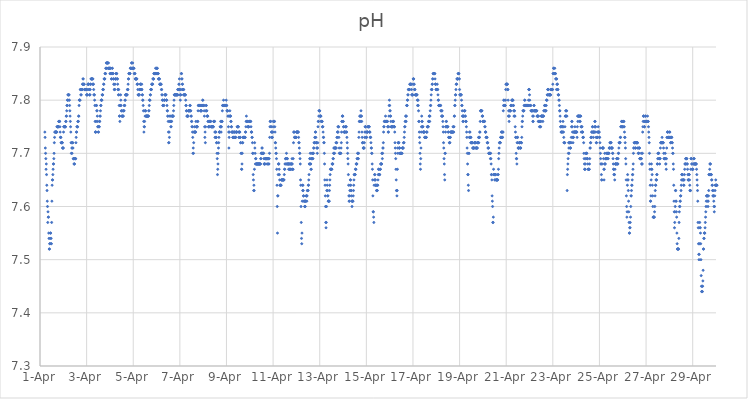
| Category | pH |
|---|---|
| 44287.208333333336 | 7.74 |
| 44287.21875 | 7.73 |
| 44287.229166666664 | 7.71 |
| 44287.239583333336 | 7.7 |
| 44287.25 | 7.69 |
| 44287.260416666664 | 7.67 |
| 44287.270833333336 | 7.68 |
| 44287.28125 | 7.66 |
| 44287.291666666664 | 7.64 |
| 44287.302083333336 | 7.63 |
| 44287.3125 | 7.61 |
| 44287.322916666664 | 7.6 |
| 44287.333333333336 | 7.57 |
| 44287.34375 | 7.59 |
| 44287.354166666664 | 7.58 |
| 44287.364583333336 | 7.58 |
| 44287.375 | 7.55 |
| 44287.385416666664 | 7.54 |
| 44287.395833333336 | 7.52 |
| 44287.40625 | 7.52 |
| 44287.416666666664 | 7.53 |
| 44287.427083333336 | 7.53 |
| 44287.4375 | 7.54 |
| 44287.447916666664 | 7.55 |
| 44287.458333333336 | 7.55 |
| 44287.46875 | 7.53 |
| 44287.479166666664 | 7.54 |
| 44287.489583333336 | 7.53 |
| 44287.5 | 7.57 |
| 44287.510416666664 | 7.61 |
| 44287.520833333336 | 7.64 |
| 44287.53125 | 7.65 |
| 44287.541666666664 | 7.65 |
| 44287.552083333336 | 7.66 |
| 44287.5625 | 7.67 |
| 44287.572916666664 | 7.68 |
| 44287.583333333336 | 7.68 |
| 44287.59375 | 7.69 |
| 44287.604166666664 | 7.7 |
| 44287.614583333336 | 7.72 |
| 44287.625 | 7.73 |
| 44287.635416666664 | 7.74 |
| 44287.645833333336 | 7.74 |
| 44287.65625 | 7.74 |
| 44287.666666666664 | 7.74 |
| 44287.677083333336 | 7.74 |
| 44287.6875 | 7.74 |
| 44287.697916666664 | 7.74 |
| 44287.708333333336 | 7.74 |
| 44287.71875 | 7.74 |
| 44287.729166666664 | 7.75 |
| 44287.739583333336 | 7.75 |
| 44287.75 | 7.75 |
| 44287.760416666664 | 7.75 |
| 44287.770833333336 | 7.75 |
| 44287.78125 | 7.75 |
| 44287.791666666664 | 7.75 |
| 44287.802083333336 | 7.76 |
| 44287.8125 | 7.76 |
| 44287.822916666664 | 7.76 |
| 44287.833333333336 | 7.76 |
| 44287.84375 | 7.76 |
| 44287.854166666664 | 7.75 |
| 44287.864583333336 | 7.74 |
| 44287.875 | 7.73 |
| 44287.885416666664 | 7.73 |
| 44287.895833333336 | 7.73 |
| 44287.90625 | 7.72 |
| 44287.916666666664 | 7.72 |
| 44287.927083333336 | 7.72 |
| 44287.9375 | 7.72 |
| 44287.947916666664 | 7.72 |
| 44287.958333333336 | 7.72 |
| 44287.96875 | 7.71 |
| 44287.979166666664 | 7.71 |
| 44287.989583333336 | 7.71 |
| 44288.0 | 7.71 |
| 44288.010416666664 | 7.74 |
| 44288.020833333336 | 7.75 |
| 44288.03125 | 7.75 |
| 44288.041666666664 | 7.75 |
| 44288.052083333336 | 7.75 |
| 44288.0625 | 7.75 |
| 44288.072916666664 | 7.75 |
| 44288.083333333336 | 7.75 |
| 44288.09375 | 7.75 |
| 44288.104166666664 | 7.76 |
| 44288.114583333336 | 7.76 |
| 44288.125 | 7.77 |
| 44288.135416666664 | 7.77 |
| 44288.145833333336 | 7.78 |
| 44288.15625 | 7.79 |
| 44288.166666666664 | 7.79 |
| 44288.177083333336 | 7.8 |
| 44288.1875 | 7.8 |
| 44288.197916666664 | 7.81 |
| 44288.208333333336 | 7.81 |
| 44288.21875 | 7.81 |
| 44288.229166666664 | 7.81 |
| 44288.239583333336 | 7.8 |
| 44288.25 | 7.81 |
| 44288.260416666664 | 7.8 |
| 44288.270833333336 | 7.79 |
| 44288.28125 | 7.78 |
| 44288.291666666664 | 7.77 |
| 44288.302083333336 | 7.76 |
| 44288.3125 | 7.75 |
| 44288.322916666664 | 7.74 |
| 44288.333333333336 | 7.72 |
| 44288.34375 | 7.7 |
| 44288.354166666664 | 7.72 |
| 44288.364583333336 | 7.71 |
| 44288.375 | 7.7 |
| 44288.385416666664 | 7.71 |
| 44288.395833333336 | 7.72 |
| 44288.40625 | 7.72 |
| 44288.416666666664 | 7.71 |
| 44288.427083333336 | 7.69 |
| 44288.4375 | 7.69 |
| 44288.447916666664 | 7.69 |
| 44288.458333333336 | 7.68 |
| 44288.46875 | 7.68 |
| 44288.479166666664 | 7.68 |
| 44288.489583333336 | 7.69 |
| 44288.5 | 7.69 |
| 44288.510416666664 | 7.69 |
| 44288.520833333336 | 7.69 |
| 44288.53125 | 7.69 |
| 44288.541666666664 | 7.72 |
| 44288.552083333336 | 7.73 |
| 44288.5625 | 7.74 |
| 44288.572916666664 | 7.74 |
| 44288.583333333336 | 7.75 |
| 44288.59375 | 7.75 |
| 44288.604166666664 | 7.75 |
| 44288.614583333336 | 7.75 |
| 44288.625 | 7.76 |
| 44288.635416666664 | 7.76 |
| 44288.645833333336 | 7.76 |
| 44288.65625 | 7.77 |
| 44288.666666666664 | 7.77 |
| 44288.677083333336 | 7.79 |
| 44288.6875 | 7.8 |
| 44288.697916666664 | 7.8 |
| 44288.708333333336 | 7.8 |
| 44288.71875 | 7.8 |
| 44288.729166666664 | 7.82 |
| 44288.739583333336 | 7.82 |
| 44288.75 | 7.81 |
| 44288.760416666664 | 7.82 |
| 44288.770833333336 | 7.81 |
| 44288.78125 | 7.82 |
| 44288.791666666664 | 7.82 |
| 44288.802083333336 | 7.82 |
| 44288.8125 | 7.82 |
| 44288.822916666664 | 7.83 |
| 44288.833333333336 | 7.83 |
| 44288.84375 | 7.84 |
| 44288.854166666664 | 7.84 |
| 44288.864583333336 | 7.83 |
| 44288.875 | 7.83 |
| 44288.885416666664 | 7.83 |
| 44288.895833333336 | 7.83 |
| 44288.90625 | 7.82 |
| 44288.916666666664 | 7.82 |
| 44288.927083333336 | 7.82 |
| 44288.9375 | 7.82 |
| 44288.947916666664 | 7.82 |
| 44288.958333333336 | 7.82 |
| 44288.96875 | 7.82 |
| 44288.979166666664 | 7.82 |
| 44288.989583333336 | 7.82 |
| 44289.0 | 7.81 |
| 44289.010416666664 | 7.81 |
| 44289.020833333336 | 7.81 |
| 44289.03125 | 7.81 |
| 44289.041666666664 | 7.82 |
| 44289.052083333336 | 7.83 |
| 44289.0625 | 7.83 |
| 44289.072916666664 | 7.83 |
| 44289.083333333336 | 7.83 |
| 44289.09375 | 7.83 |
| 44289.104166666664 | 7.82 |
| 44289.114583333336 | 7.82 |
| 44289.125 | 7.81 |
| 44289.135416666664 | 7.81 |
| 44289.145833333336 | 7.81 |
| 44289.15625 | 7.82 |
| 44289.166666666664 | 7.83 |
| 44289.177083333336 | 7.83 |
| 44289.1875 | 7.84 |
| 44289.197916666664 | 7.84 |
| 44289.208333333336 | 7.84 |
| 44289.21875 | 7.84 |
| 44289.229166666664 | 7.84 |
| 44289.239583333336 | 7.84 |
| 44289.25 | 7.84 |
| 44289.260416666664 | 7.83 |
| 44289.270833333336 | 7.84 |
| 44289.28125 | 7.83 |
| 44289.291666666664 | 7.83 |
| 44289.302083333336 | 7.82 |
| 44289.3125 | 7.81 |
| 44289.322916666664 | 7.81 |
| 44289.333333333336 | 7.81 |
| 44289.34375 | 7.8 |
| 44289.354166666664 | 7.79 |
| 44289.364583333336 | 7.76 |
| 44289.375 | 7.74 |
| 44289.385416666664 | 7.74 |
| 44289.395833333336 | 7.74 |
| 44289.40625 | 7.76 |
| 44289.416666666664 | 7.79 |
| 44289.427083333336 | 7.79 |
| 44289.4375 | 7.78 |
| 44289.447916666664 | 7.78 |
| 44289.458333333336 | 7.77 |
| 44289.46875 | 7.76 |
| 44289.479166666664 | 7.75 |
| 44289.489583333336 | 7.75 |
| 44289.5 | 7.74 |
| 44289.510416666664 | 7.74 |
| 44289.520833333336 | 7.75 |
| 44289.53125 | 7.75 |
| 44289.541666666664 | 7.75 |
| 44289.552083333336 | 7.76 |
| 44289.5625 | 7.76 |
| 44289.572916666664 | 7.77 |
| 44289.583333333336 | 7.77 |
| 44289.59375 | 7.78 |
| 44289.604166666664 | 7.79 |
| 44289.614583333336 | 7.79 |
| 44289.625 | 7.8 |
| 44289.635416666664 | 7.8 |
| 44289.645833333336 | 7.8 |
| 44289.65625 | 7.8 |
| 44289.666666666664 | 7.81 |
| 44289.677083333336 | 7.81 |
| 44289.6875 | 7.81 |
| 44289.697916666664 | 7.82 |
| 44289.708333333336 | 7.82 |
| 44289.71875 | 7.82 |
| 44289.729166666664 | 7.83 |
| 44289.739583333336 | 7.83 |
| 44289.75 | 7.84 |
| 44289.760416666664 | 7.84 |
| 44289.770833333336 | 7.84 |
| 44289.78125 | 7.84 |
| 44289.791666666664 | 7.85 |
| 44289.802083333336 | 7.85 |
| 44289.8125 | 7.85 |
| 44289.822916666664 | 7.86 |
| 44289.833333333336 | 7.86 |
| 44289.84375 | 7.87 |
| 44289.854166666664 | 7.86 |
| 44289.864583333336 | 7.87 |
| 44289.875 | 7.87 |
| 44289.885416666664 | 7.87 |
| 44289.895833333336 | 7.87 |
| 44289.90625 | 7.87 |
| 44289.916666666664 | 7.86 |
| 44289.927083333336 | 7.86 |
| 44289.9375 | 7.87 |
| 44289.947916666664 | 7.86 |
| 44289.958333333336 | 7.86 |
| 44289.96875 | 7.86 |
| 44289.979166666664 | 7.86 |
| 44289.989583333336 | 7.86 |
| 44290.0 | 7.85 |
| 44290.010416666664 | 7.86 |
| 44290.020833333336 | 7.86 |
| 44290.03125 | 7.85 |
| 44290.041666666664 | 7.85 |
| 44290.052083333336 | 7.85 |
| 44290.0625 | 7.84 |
| 44290.072916666664 | 7.84 |
| 44290.083333333336 | 7.85 |
| 44290.09375 | 7.86 |
| 44290.104166666664 | 7.86 |
| 44290.114583333336 | 7.85 |
| 44290.125 | 7.85 |
| 44290.135416666664 | 7.85 |
| 44290.145833333336 | 7.84 |
| 44290.15625 | 7.84 |
| 44290.166666666664 | 7.83 |
| 44290.177083333336 | 7.83 |
| 44290.1875 | 7.82 |
| 44290.197916666664 | 7.82 |
| 44290.208333333336 | 7.82 |
| 44290.21875 | 7.83 |
| 44290.229166666664 | 7.84 |
| 44290.239583333336 | 7.84 |
| 44290.25 | 7.84 |
| 44290.260416666664 | 7.85 |
| 44290.270833333336 | 7.85 |
| 44290.28125 | 7.85 |
| 44290.291666666664 | 7.85 |
| 44290.302083333336 | 7.84 |
| 44290.3125 | 7.84 |
| 44290.322916666664 | 7.84 |
| 44290.333333333336 | 7.83 |
| 44290.34375 | 7.82 |
| 44290.354166666664 | 7.82 |
| 44290.364583333336 | 7.81 |
| 44290.375 | 7.82 |
| 44290.385416666664 | 7.81 |
| 44290.395833333336 | 7.79 |
| 44290.40625 | 7.77 |
| 44290.416666666664 | 7.77 |
| 44290.427083333336 | 7.76 |
| 44290.4375 | 7.79 |
| 44290.447916666664 | 7.79 |
| 44290.458333333336 | 7.81 |
| 44290.46875 | 7.8 |
| 44290.479166666664 | 7.79 |
| 44290.489583333336 | 7.78 |
| 44290.5 | 7.78 |
| 44290.510416666664 | 7.77 |
| 44290.520833333336 | 7.77 |
| 44290.53125 | 7.77 |
| 44290.541666666664 | 7.77 |
| 44290.552083333336 | 7.78 |
| 44290.5625 | 7.77 |
| 44290.572916666664 | 7.77 |
| 44290.583333333336 | 7.78 |
| 44290.59375 | 7.78 |
| 44290.604166666664 | 7.78 |
| 44290.614583333336 | 7.79 |
| 44290.625 | 7.79 |
| 44290.635416666664 | 7.79 |
| 44290.645833333336 | 7.8 |
| 44290.65625 | 7.8 |
| 44290.666666666664 | 7.81 |
| 44290.677083333336 | 7.81 |
| 44290.6875 | 7.81 |
| 44290.697916666664 | 7.81 |
| 44290.708333333336 | 7.81 |
| 44290.71875 | 7.81 |
| 44290.729166666664 | 7.81 |
| 44290.739583333336 | 7.81 |
| 44290.75 | 7.82 |
| 44290.760416666664 | 7.82 |
| 44290.770833333336 | 7.82 |
| 44290.78125 | 7.83 |
| 44290.791666666664 | 7.84 |
| 44290.802083333336 | 7.84 |
| 44290.8125 | 7.85 |
| 44290.822916666664 | 7.85 |
| 44290.833333333336 | 7.85 |
| 44290.84375 | 7.85 |
| 44290.854166666664 | 7.85 |
| 44290.864583333336 | 7.85 |
| 44290.875 | 7.86 |
| 44290.885416666664 | 7.86 |
| 44290.895833333336 | 7.86 |
| 44290.90625 | 7.86 |
| 44290.916666666664 | 7.86 |
| 44290.927083333336 | 7.87 |
| 44290.9375 | 7.87 |
| 44290.947916666664 | 7.86 |
| 44290.958333333336 | 7.86 |
| 44290.96875 | 7.86 |
| 44290.979166666664 | 7.87 |
| 44290.989583333336 | 7.86 |
| 44291.0 | 7.86 |
| 44291.010416666664 | 7.86 |
| 44291.020833333336 | 7.86 |
| 44291.03125 | 7.86 |
| 44291.041666666664 | 7.85 |
| 44291.052083333336 | 7.85 |
| 44291.0625 | 7.85 |
| 44291.072916666664 | 7.85 |
| 44291.083333333336 | 7.84 |
| 44291.09375 | 7.84 |
| 44291.104166666664 | 7.84 |
| 44291.114583333336 | 7.84 |
| 44291.125 | 7.84 |
| 44291.135416666664 | 7.84 |
| 44291.145833333336 | 7.84 |
| 44291.15625 | 7.84 |
| 44291.166666666664 | 7.83 |
| 44291.177083333336 | 7.83 |
| 44291.1875 | 7.83 |
| 44291.197916666664 | 7.82 |
| 44291.208333333336 | 7.81 |
| 44291.21875 | 7.81 |
| 44291.229166666664 | 7.81 |
| 44291.239583333336 | 7.81 |
| 44291.25 | 7.81 |
| 44291.260416666664 | 7.81 |
| 44291.270833333336 | 7.82 |
| 44291.28125 | 7.82 |
| 44291.291666666664 | 7.82 |
| 44291.302083333336 | 7.83 |
| 44291.3125 | 7.83 |
| 44291.322916666664 | 7.83 |
| 44291.333333333336 | 7.82 |
| 44291.34375 | 7.82 |
| 44291.354166666664 | 7.82 |
| 44291.364583333336 | 7.83 |
| 44291.375 | 7.82 |
| 44291.385416666664 | 7.81 |
| 44291.395833333336 | 7.81 |
| 44291.40625 | 7.8 |
| 44291.416666666664 | 7.8 |
| 44291.427083333336 | 7.79 |
| 44291.4375 | 7.78 |
| 44291.447916666664 | 7.76 |
| 44291.458333333336 | 7.74 |
| 44291.46875 | 7.75 |
| 44291.479166666664 | 7.75 |
| 44291.489583333336 | 7.76 |
| 44291.5 | 7.78 |
| 44291.510416666664 | 7.77 |
| 44291.520833333336 | 7.78 |
| 44291.53125 | 7.78 |
| 44291.541666666664 | 7.77 |
| 44291.552083333336 | 7.77 |
| 44291.5625 | 7.77 |
| 44291.572916666664 | 7.77 |
| 44291.583333333336 | 7.77 |
| 44291.59375 | 7.77 |
| 44291.604166666664 | 7.77 |
| 44291.614583333336 | 7.77 |
| 44291.625 | 7.77 |
| 44291.635416666664 | 7.77 |
| 44291.645833333336 | 7.77 |
| 44291.65625 | 7.77 |
| 44291.666666666664 | 7.78 |
| 44291.677083333336 | 7.78 |
| 44291.6875 | 7.79 |
| 44291.697916666664 | 7.8 |
| 44291.708333333336 | 7.8 |
| 44291.71875 | 7.8 |
| 44291.729166666664 | 7.81 |
| 44291.739583333336 | 7.81 |
| 44291.75 | 7.82 |
| 44291.760416666664 | 7.82 |
| 44291.770833333336 | 7.82 |
| 44291.78125 | 7.82 |
| 44291.791666666664 | 7.83 |
| 44291.802083333336 | 7.83 |
| 44291.8125 | 7.83 |
| 44291.822916666664 | 7.83 |
| 44291.833333333336 | 7.83 |
| 44291.84375 | 7.84 |
| 44291.854166666664 | 7.84 |
| 44291.864583333336 | 7.84 |
| 44291.875 | 7.84 |
| 44291.885416666664 | 7.85 |
| 44291.895833333336 | 7.85 |
| 44291.90625 | 7.85 |
| 44291.916666666664 | 7.85 |
| 44291.927083333336 | 7.85 |
| 44291.9375 | 7.85 |
| 44291.947916666664 | 7.85 |
| 44291.958333333336 | 7.86 |
| 44291.96875 | 7.85 |
| 44291.979166666664 | 7.85 |
| 44291.989583333336 | 7.85 |
| 44292.0 | 7.86 |
| 44292.010416666664 | 7.86 |
| 44292.020833333336 | 7.86 |
| 44292.03125 | 7.86 |
| 44292.041666666664 | 7.85 |
| 44292.052083333336 | 7.85 |
| 44292.0625 | 7.85 |
| 44292.072916666664 | 7.85 |
| 44292.083333333336 | 7.84 |
| 44292.09375 | 7.84 |
| 44292.104166666664 | 7.84 |
| 44292.114583333336 | 7.84 |
| 44292.125 | 7.84 |
| 44292.135416666664 | 7.83 |
| 44292.145833333336 | 7.83 |
| 44292.15625 | 7.83 |
| 44292.166666666664 | 7.83 |
| 44292.177083333336 | 7.83 |
| 44292.1875 | 7.83 |
| 44292.197916666664 | 7.83 |
| 44292.208333333336 | 7.82 |
| 44292.21875 | 7.82 |
| 44292.229166666664 | 7.81 |
| 44292.239583333336 | 7.81 |
| 44292.25 | 7.8 |
| 44292.260416666664 | 7.8 |
| 44292.270833333336 | 7.79 |
| 44292.28125 | 7.79 |
| 44292.291666666664 | 7.79 |
| 44292.302083333336 | 7.79 |
| 44292.3125 | 7.79 |
| 44292.322916666664 | 7.8 |
| 44292.333333333336 | 7.8 |
| 44292.34375 | 7.8 |
| 44292.354166666664 | 7.81 |
| 44292.364583333336 | 7.81 |
| 44292.375 | 7.81 |
| 44292.385416666664 | 7.81 |
| 44292.395833333336 | 7.81 |
| 44292.40625 | 7.81 |
| 44292.416666666664 | 7.8 |
| 44292.427083333336 | 7.8 |
| 44292.4375 | 7.8 |
| 44292.447916666664 | 7.79 |
| 44292.458333333336 | 7.78 |
| 44292.46875 | 7.78 |
| 44292.479166666664 | 7.77 |
| 44292.489583333336 | 7.77 |
| 44292.5 | 7.76 |
| 44292.510416666664 | 7.74 |
| 44292.520833333336 | 7.72 |
| 44292.53125 | 7.72 |
| 44292.541666666664 | 7.74 |
| 44292.552083333336 | 7.73 |
| 44292.5625 | 7.76 |
| 44292.572916666664 | 7.77 |
| 44292.583333333336 | 7.77 |
| 44292.59375 | 7.76 |
| 44292.604166666664 | 7.76 |
| 44292.614583333336 | 7.75 |
| 44292.625 | 7.75 |
| 44292.635416666664 | 7.76 |
| 44292.645833333336 | 7.76 |
| 44292.65625 | 7.77 |
| 44292.666666666664 | 7.77 |
| 44292.677083333336 | 7.77 |
| 44292.6875 | 7.77 |
| 44292.697916666664 | 7.77 |
| 44292.708333333336 | 7.77 |
| 44292.71875 | 7.77 |
| 44292.729166666664 | 7.78 |
| 44292.739583333336 | 7.79 |
| 44292.75 | 7.8 |
| 44292.760416666664 | 7.81 |
| 44292.770833333336 | 7.81 |
| 44292.78125 | 7.81 |
| 44292.791666666664 | 7.81 |
| 44292.802083333336 | 7.81 |
| 44292.8125 | 7.81 |
| 44292.822916666664 | 7.81 |
| 44292.833333333336 | 7.81 |
| 44292.84375 | 7.81 |
| 44292.854166666664 | 7.81 |
| 44292.864583333336 | 7.81 |
| 44292.875 | 7.81 |
| 44292.885416666664 | 7.81 |
| 44292.895833333336 | 7.81 |
| 44292.90625 | 7.82 |
| 44292.916666666664 | 7.81 |
| 44292.927083333336 | 7.82 |
| 44292.9375 | 7.82 |
| 44292.947916666664 | 7.82 |
| 44292.958333333336 | 7.83 |
| 44292.96875 | 7.83 |
| 44292.979166666664 | 7.84 |
| 44292.989583333336 | 7.82 |
| 44293.0 | 7.82 |
| 44293.010416666664 | 7.81 |
| 44293.020833333336 | 7.8 |
| 44293.03125 | 7.81 |
| 44293.041666666664 | 7.81 |
| 44293.052083333336 | 7.82 |
| 44293.0625 | 7.85 |
| 44293.072916666664 | 7.85 |
| 44293.083333333336 | 7.84 |
| 44293.09375 | 7.84 |
| 44293.104166666664 | 7.83 |
| 44293.114583333336 | 7.83 |
| 44293.125 | 7.82 |
| 44293.135416666664 | 7.82 |
| 44293.145833333336 | 7.82 |
| 44293.15625 | 7.81 |
| 44293.166666666664 | 7.82 |
| 44293.177083333336 | 7.81 |
| 44293.1875 | 7.81 |
| 44293.197916666664 | 7.81 |
| 44293.208333333336 | 7.81 |
| 44293.21875 | 7.81 |
| 44293.229166666664 | 7.81 |
| 44293.239583333336 | 7.81 |
| 44293.25 | 7.8 |
| 44293.260416666664 | 7.79 |
| 44293.270833333336 | 7.79 |
| 44293.28125 | 7.78 |
| 44293.291666666664 | 7.78 |
| 44293.302083333336 | 7.77 |
| 44293.3125 | 7.77 |
| 44293.322916666664 | 7.77 |
| 44293.333333333336 | 7.77 |
| 44293.34375 | 7.77 |
| 44293.354166666664 | 7.77 |
| 44293.364583333336 | 7.78 |
| 44293.375 | 7.78 |
| 44293.385416666664 | 7.78 |
| 44293.395833333336 | 7.78 |
| 44293.40625 | 7.78 |
| 44293.416666666664 | 7.78 |
| 44293.427083333336 | 7.79 |
| 44293.4375 | 7.78 |
| 44293.447916666664 | 7.79 |
| 44293.458333333336 | 7.78 |
| 44293.46875 | 7.78 |
| 44293.479166666664 | 7.77 |
| 44293.489583333336 | 7.77 |
| 44293.5 | 7.76 |
| 44293.510416666664 | 7.76 |
| 44293.520833333336 | 7.75 |
| 44293.53125 | 7.75 |
| 44293.541666666664 | 7.74 |
| 44293.552083333336 | 7.73 |
| 44293.5625 | 7.7 |
| 44293.572916666664 | 7.71 |
| 44293.583333333336 | 7.7 |
| 44293.59375 | 7.72 |
| 44293.604166666664 | 7.74 |
| 44293.614583333336 | 7.74 |
| 44293.625 | 7.75 |
| 44293.635416666664 | 7.74 |
| 44293.645833333336 | 7.74 |
| 44293.65625 | 7.74 |
| 44293.666666666664 | 7.74 |
| 44293.677083333336 | 7.74 |
| 44293.6875 | 7.76 |
| 44293.697916666664 | 7.75 |
| 44293.708333333336 | 7.75 |
| 44293.71875 | 7.75 |
| 44293.729166666664 | 7.75 |
| 44293.739583333336 | 7.75 |
| 44293.75 | 7.75 |
| 44293.760416666664 | 7.76 |
| 44293.770833333336 | 7.76 |
| 44293.78125 | 7.78 |
| 44293.791666666664 | 7.79 |
| 44293.802083333336 | 7.79 |
| 44293.8125 | 7.79 |
| 44293.822916666664 | 7.79 |
| 44293.833333333336 | 7.79 |
| 44293.84375 | 7.79 |
| 44293.854166666664 | 7.79 |
| 44293.864583333336 | 7.79 |
| 44293.875 | 7.79 |
| 44293.885416666664 | 7.78 |
| 44293.895833333336 | 7.78 |
| 44293.90625 | 7.78 |
| 44293.916666666664 | 7.78 |
| 44293.927083333336 | 7.78 |
| 44293.9375 | 7.79 |
| 44293.947916666664 | 7.79 |
| 44293.958333333336 | 7.79 |
| 44293.96875 | 7.79 |
| 44293.979166666664 | 7.8 |
| 44293.989583333336 | 7.8 |
| 44294.0 | 7.79 |
| 44294.010416666664 | 7.79 |
| 44294.020833333336 | 7.79 |
| 44294.03125 | 7.79 |
| 44294.041666666664 | 7.78 |
| 44294.052083333336 | 7.77 |
| 44294.0625 | 7.75 |
| 44294.072916666664 | 7.73 |
| 44294.083333333336 | 7.74 |
| 44294.09375 | 7.72 |
| 44294.104166666664 | 7.75 |
| 44294.114583333336 | 7.78 |
| 44294.125 | 7.79 |
| 44294.135416666664 | 7.79 |
| 44294.145833333336 | 7.78 |
| 44294.15625 | 7.78 |
| 44294.166666666664 | 7.77 |
| 44294.177083333336 | 7.77 |
| 44294.1875 | 7.77 |
| 44294.197916666664 | 7.77 |
| 44294.208333333336 | 7.76 |
| 44294.21875 | 7.76 |
| 44294.229166666664 | 7.75 |
| 44294.239583333336 | 7.75 |
| 44294.25 | 7.75 |
| 44294.260416666664 | 7.75 |
| 44294.270833333336 | 7.76 |
| 44294.28125 | 7.76 |
| 44294.291666666664 | 7.76 |
| 44294.302083333336 | 7.76 |
| 44294.3125 | 7.76 |
| 44294.322916666664 | 7.76 |
| 44294.333333333336 | 7.75 |
| 44294.34375 | 7.75 |
| 44294.354166666664 | 7.75 |
| 44294.364583333336 | 7.75 |
| 44294.375 | 7.75 |
| 44294.385416666664 | 7.75 |
| 44294.395833333336 | 7.75 |
| 44294.40625 | 7.75 |
| 44294.416666666664 | 7.75 |
| 44294.427083333336 | 7.75 |
| 44294.4375 | 7.75 |
| 44294.447916666664 | 7.76 |
| 44294.458333333336 | 7.76 |
| 44294.46875 | 7.76 |
| 44294.479166666664 | 7.76 |
| 44294.489583333336 | 7.76 |
| 44294.5 | 7.74 |
| 44294.510416666664 | 7.73 |
| 44294.520833333336 | 7.73 |
| 44294.53125 | 7.74 |
| 44294.541666666664 | 7.74 |
| 44294.552083333336 | 7.73 |
| 44294.5625 | 7.73 |
| 44294.572916666664 | 7.72 |
| 44294.583333333336 | 7.72 |
| 44294.59375 | 7.7 |
| 44294.604166666664 | 7.69 |
| 44294.614583333336 | 7.66 |
| 44294.625 | 7.67 |
| 44294.635416666664 | 7.68 |
| 44294.645833333336 | 7.7 |
| 44294.65625 | 7.71 |
| 44294.666666666664 | 7.72 |
| 44294.677083333336 | 7.73 |
| 44294.6875 | 7.74 |
| 44294.697916666664 | 7.74 |
| 44294.708333333336 | 7.74 |
| 44294.71875 | 7.74 |
| 44294.729166666664 | 7.75 |
| 44294.739583333336 | 7.75 |
| 44294.75 | 7.76 |
| 44294.760416666664 | 7.75 |
| 44294.770833333336 | 7.74 |
| 44294.78125 | 7.75 |
| 44294.791666666664 | 7.76 |
| 44294.802083333336 | 7.76 |
| 44294.8125 | 7.76 |
| 44294.822916666664 | 7.78 |
| 44294.833333333336 | 7.79 |
| 44294.84375 | 7.79 |
| 44294.854166666664 | 7.79 |
| 44294.864583333336 | 7.79 |
| 44294.875 | 7.8 |
| 44294.885416666664 | 7.79 |
| 44294.895833333336 | 7.79 |
| 44294.90625 | 7.79 |
| 44294.916666666664 | 7.79 |
| 44294.927083333336 | 7.79 |
| 44294.9375 | 7.79 |
| 44294.947916666664 | 7.79 |
| 44294.958333333336 | 7.79 |
| 44294.96875 | 7.79 |
| 44294.979166666664 | 7.79 |
| 44294.989583333336 | 7.8 |
| 44295.0 | 7.79 |
| 44295.010416666664 | 7.79 |
| 44295.020833333336 | 7.78 |
| 44295.03125 | 7.78 |
| 44295.041666666664 | 7.78 |
| 44295.052083333336 | 7.78 |
| 44295.0625 | 7.77 |
| 44295.072916666664 | 7.77 |
| 44295.083333333336 | 7.75 |
| 44295.09375 | 7.74 |
| 44295.104166666664 | 7.71 |
| 44295.114583333336 | 7.73 |
| 44295.125 | 7.74 |
| 44295.135416666664 | 7.77 |
| 44295.145833333336 | 7.78 |
| 44295.15625 | 7.77 |
| 44295.166666666664 | 7.77 |
| 44295.177083333336 | 7.77 |
| 44295.1875 | 7.76 |
| 44295.197916666664 | 7.76 |
| 44295.208333333336 | 7.75 |
| 44295.21875 | 7.75 |
| 44295.229166666664 | 7.74 |
| 44295.239583333336 | 7.74 |
| 44295.25 | 7.74 |
| 44295.260416666664 | 7.74 |
| 44295.270833333336 | 7.73 |
| 44295.28125 | 7.73 |
| 44295.291666666664 | 7.73 |
| 44295.302083333336 | 7.73 |
| 44295.3125 | 7.74 |
| 44295.322916666664 | 7.74 |
| 44295.333333333336 | 7.74 |
| 44295.34375 | 7.73 |
| 44295.354166666664 | 7.74 |
| 44295.364583333336 | 7.73 |
| 44295.375 | 7.73 |
| 44295.385416666664 | 7.73 |
| 44295.395833333336 | 7.73 |
| 44295.40625 | 7.74 |
| 44295.416666666664 | 7.74 |
| 44295.427083333336 | 7.74 |
| 44295.4375 | 7.74 |
| 44295.447916666664 | 7.74 |
| 44295.458333333336 | 7.75 |
| 44295.46875 | 7.75 |
| 44295.479166666664 | 7.75 |
| 44295.489583333336 | 7.75 |
| 44295.5 | 7.75 |
| 44295.510416666664 | 7.75 |
| 44295.520833333336 | 7.74 |
| 44295.53125 | 7.73 |
| 44295.541666666664 | 7.73 |
| 44295.552083333336 | 7.74 |
| 44295.5625 | 7.74 |
| 44295.572916666664 | 7.74 |
| 44295.583333333336 | 7.73 |
| 44295.59375 | 7.73 |
| 44295.604166666664 | 7.72 |
| 44295.614583333336 | 7.72 |
| 44295.625 | 7.7 |
| 44295.635416666664 | 7.7 |
| 44295.645833333336 | 7.67 |
| 44295.65625 | 7.67 |
| 44295.666666666664 | 7.68 |
| 44295.677083333336 | 7.7 |
| 44295.6875 | 7.72 |
| 44295.697916666664 | 7.72 |
| 44295.708333333336 | 7.73 |
| 44295.71875 | 7.73 |
| 44295.729166666664 | 7.73 |
| 44295.739583333336 | 7.73 |
| 44295.75 | 7.73 |
| 44295.760416666664 | 7.73 |
| 44295.770833333336 | 7.73 |
| 44295.78125 | 7.73 |
| 44295.791666666664 | 7.73 |
| 44295.802083333336 | 7.73 |
| 44295.8125 | 7.74 |
| 44295.822916666664 | 7.74 |
| 44295.833333333336 | 7.75 |
| 44295.84375 | 7.76 |
| 44295.854166666664 | 7.77 |
| 44295.864583333336 | 7.76 |
| 44295.875 | 7.76 |
| 44295.885416666664 | 7.76 |
| 44295.895833333336 | 7.76 |
| 44295.90625 | 7.76 |
| 44295.916666666664 | 7.75 |
| 44295.927083333336 | 7.75 |
| 44295.9375 | 7.75 |
| 44295.947916666664 | 7.75 |
| 44295.958333333336 | 7.75 |
| 44295.96875 | 7.76 |
| 44295.979166666664 | 7.76 |
| 44295.989583333336 | 7.76 |
| 44296.0 | 7.76 |
| 44296.010416666664 | 7.76 |
| 44296.020833333336 | 7.76 |
| 44296.03125 | 7.76 |
| 44296.041666666664 | 7.76 |
| 44296.052083333336 | 7.75 |
| 44296.0625 | 7.74 |
| 44296.072916666664 | 7.74 |
| 44296.083333333336 | 7.74 |
| 44296.09375 | 7.73 |
| 44296.104166666664 | 7.73 |
| 44296.114583333336 | 7.72 |
| 44296.125 | 7.7 |
| 44296.135416666664 | 7.7 |
| 44296.145833333336 | 7.66 |
| 44296.15625 | 7.65 |
| 44296.166666666664 | 7.63 |
| 44296.177083333336 | 7.64 |
| 44296.1875 | 7.63 |
| 44296.197916666664 | 7.67 |
| 44296.208333333336 | 7.72 |
| 44296.21875 | 7.71 |
| 44296.229166666664 | 7.7 |
| 44296.239583333336 | 7.68 |
| 44296.25 | 7.69 |
| 44296.260416666664 | 7.69 |
| 44296.270833333336 | 7.68 |
| 44296.28125 | 7.68 |
| 44296.291666666664 | 7.68 |
| 44296.302083333336 | 7.68 |
| 44296.3125 | 7.68 |
| 44296.322916666664 | 7.68 |
| 44296.333333333336 | 7.68 |
| 44296.34375 | 7.68 |
| 44296.354166666664 | 7.68 |
| 44296.364583333336 | 7.68 |
| 44296.375 | 7.68 |
| 44296.385416666664 | 7.68 |
| 44296.395833333336 | 7.68 |
| 44296.40625 | 7.68 |
| 44296.416666666664 | 7.68 |
| 44296.427083333336 | 7.68 |
| 44296.4375 | 7.68 |
| 44296.447916666664 | 7.68 |
| 44296.458333333336 | 7.68 |
| 44296.46875 | 7.69 |
| 44296.479166666664 | 7.69 |
| 44296.489583333336 | 7.7 |
| 44296.5 | 7.7 |
| 44296.510416666664 | 7.7 |
| 44296.520833333336 | 7.71 |
| 44296.53125 | 7.71 |
| 44296.541666666664 | 7.7 |
| 44296.552083333336 | 7.7 |
| 44296.5625 | 7.7 |
| 44296.572916666664 | 7.7 |
| 44296.583333333336 | 7.7 |
| 44296.59375 | 7.7 |
| 44296.604166666664 | 7.69 |
| 44296.614583333336 | 7.68 |
| 44296.625 | 7.68 |
| 44296.635416666664 | 7.68 |
| 44296.645833333336 | 7.69 |
| 44296.65625 | 7.68 |
| 44296.666666666664 | 7.69 |
| 44296.677083333336 | 7.69 |
| 44296.6875 | 7.69 |
| 44296.697916666664 | 7.69 |
| 44296.708333333336 | 7.69 |
| 44296.71875 | 7.69 |
| 44296.729166666664 | 7.69 |
| 44296.739583333336 | 7.68 |
| 44296.75 | 7.69 |
| 44296.760416666664 | 7.69 |
| 44296.770833333336 | 7.68 |
| 44296.78125 | 7.69 |
| 44296.791666666664 | 7.69 |
| 44296.802083333336 | 7.69 |
| 44296.8125 | 7.68 |
| 44296.822916666664 | 7.68 |
| 44296.833333333336 | 7.69 |
| 44296.84375 | 7.7 |
| 44296.854166666664 | 7.73 |
| 44296.864583333336 | 7.75 |
| 44296.875 | 7.76 |
| 44296.885416666664 | 7.76 |
| 44296.895833333336 | 7.76 |
| 44296.90625 | 7.75 |
| 44296.916666666664 | 7.75 |
| 44296.927083333336 | 7.74 |
| 44296.9375 | 7.74 |
| 44296.947916666664 | 7.73 |
| 44296.958333333336 | 7.73 |
| 44296.96875 | 7.73 |
| 44296.979166666664 | 7.74 |
| 44296.989583333336 | 7.74 |
| 44297.0 | 7.75 |
| 44297.010416666664 | 7.76 |
| 44297.020833333336 | 7.76 |
| 44297.03125 | 7.76 |
| 44297.041666666664 | 7.76 |
| 44297.052083333336 | 7.76 |
| 44297.0625 | 7.76 |
| 44297.072916666664 | 7.75 |
| 44297.083333333336 | 7.74 |
| 44297.09375 | 7.72 |
| 44297.104166666664 | 7.72 |
| 44297.114583333336 | 7.71 |
| 44297.125 | 7.7 |
| 44297.135416666664 | 7.7 |
| 44297.145833333336 | 7.69 |
| 44297.15625 | 7.67 |
| 44297.166666666664 | 7.64 |
| 44297.177083333336 | 7.6 |
| 44297.1875 | 7.55 |
| 44297.197916666664 | 7.62 |
| 44297.208333333336 | 7.62 |
| 44297.21875 | 7.66 |
| 44297.229166666664 | 7.68 |
| 44297.239583333336 | 7.68 |
| 44297.25 | 7.68 |
| 44297.260416666664 | 7.67 |
| 44297.270833333336 | 7.66 |
| 44297.28125 | 7.65 |
| 44297.291666666664 | 7.64 |
| 44297.302083333336 | 7.64 |
| 44297.3125 | 7.64 |
| 44297.322916666664 | 7.64 |
| 44297.333333333336 | 7.64 |
| 44297.34375 | 7.64 |
| 44297.354166666664 | 7.65 |
| 44297.364583333336 | 7.65 |
| 44297.375 | 7.65 |
| 44297.385416666664 | 7.65 |
| 44297.395833333336 | 7.65 |
| 44297.40625 | 7.65 |
| 44297.416666666664 | 7.65 |
| 44297.427083333336 | 7.65 |
| 44297.4375 | 7.65 |
| 44297.447916666664 | 7.65 |
| 44297.458333333336 | 7.65 |
| 44297.46875 | 7.65 |
| 44297.479166666664 | 7.66 |
| 44297.489583333336 | 7.67 |
| 44297.5 | 7.67 |
| 44297.510416666664 | 7.68 |
| 44297.520833333336 | 7.68 |
| 44297.53125 | 7.69 |
| 44297.541666666664 | 7.69 |
| 44297.552083333336 | 7.69 |
| 44297.5625 | 7.69 |
| 44297.572916666664 | 7.7 |
| 44297.583333333336 | 7.68 |
| 44297.59375 | 7.68 |
| 44297.604166666664 | 7.69 |
| 44297.614583333336 | 7.69 |
| 44297.625 | 7.68 |
| 44297.635416666664 | 7.68 |
| 44297.645833333336 | 7.68 |
| 44297.65625 | 7.68 |
| 44297.666666666664 | 7.67 |
| 44297.677083333336 | 7.68 |
| 44297.6875 | 7.68 |
| 44297.697916666664 | 7.67 |
| 44297.708333333336 | 7.67 |
| 44297.71875 | 7.68 |
| 44297.729166666664 | 7.68 |
| 44297.739583333336 | 7.68 |
| 44297.75 | 7.67 |
| 44297.760416666664 | 7.67 |
| 44297.770833333336 | 7.67 |
| 44297.78125 | 7.68 |
| 44297.791666666664 | 7.68 |
| 44297.802083333336 | 7.68 |
| 44297.8125 | 7.69 |
| 44297.822916666664 | 7.68 |
| 44297.833333333336 | 7.67 |
| 44297.84375 | 7.67 |
| 44297.854166666664 | 7.67 |
| 44297.864583333336 | 7.69 |
| 44297.875 | 7.72 |
| 44297.885416666664 | 7.74 |
| 44297.895833333336 | 7.74 |
| 44297.90625 | 7.74 |
| 44297.916666666664 | 7.73 |
| 44297.927083333336 | 7.73 |
| 44297.9375 | 7.73 |
| 44297.947916666664 | 7.73 |
| 44297.958333333336 | 7.73 |
| 44297.96875 | 7.73 |
| 44297.979166666664 | 7.73 |
| 44297.989583333336 | 7.73 |
| 44298.0 | 7.74 |
| 44298.010416666664 | 7.74 |
| 44298.020833333336 | 7.74 |
| 44298.03125 | 7.74 |
| 44298.041666666664 | 7.74 |
| 44298.052083333336 | 7.74 |
| 44298.0625 | 7.74 |
| 44298.072916666664 | 7.74 |
| 44298.083333333336 | 7.74 |
| 44298.09375 | 7.73 |
| 44298.104166666664 | 7.72 |
| 44298.114583333336 | 7.72 |
| 44298.125 | 7.71 |
| 44298.135416666664 | 7.7 |
| 44298.145833333336 | 7.7 |
| 44298.15625 | 7.69 |
| 44298.166666666664 | 7.68 |
| 44298.177083333336 | 7.65 |
| 44298.1875 | 7.64 |
| 44298.197916666664 | 7.6 |
| 44298.208333333336 | 7.57 |
| 44298.21875 | 7.54 |
| 44298.229166666664 | 7.53 |
| 44298.239583333336 | 7.55 |
| 44298.25 | 7.61 |
| 44298.260416666664 | 7.64 |
| 44298.270833333336 | 7.63 |
| 44298.28125 | 7.64 |
| 44298.291666666664 | 7.63 |
| 44298.302083333336 | 7.62 |
| 44298.3125 | 7.62 |
| 44298.322916666664 | 7.61 |
| 44298.333333333336 | 7.61 |
| 44298.34375 | 7.61 |
| 44298.354166666664 | 7.6 |
| 44298.364583333336 | 7.6 |
| 44298.375 | 7.6 |
| 44298.385416666664 | 7.61 |
| 44298.395833333336 | 7.61 |
| 44298.40625 | 7.61 |
| 44298.416666666664 | 7.62 |
| 44298.427083333336 | 7.62 |
| 44298.4375 | 7.62 |
| 44298.447916666664 | 7.61 |
| 44298.458333333336 | 7.62 |
| 44298.46875 | 7.63 |
| 44298.479166666664 | 7.63 |
| 44298.489583333336 | 7.63 |
| 44298.5 | 7.63 |
| 44298.510416666664 | 7.64 |
| 44298.520833333336 | 7.64 |
| 44298.53125 | 7.65 |
| 44298.541666666664 | 7.66 |
| 44298.552083333336 | 7.68 |
| 44298.5625 | 7.68 |
| 44298.572916666664 | 7.69 |
| 44298.583333333336 | 7.69 |
| 44298.59375 | 7.7 |
| 44298.604166666664 | 7.68 |
| 44298.614583333336 | 7.68 |
| 44298.625 | 7.67 |
| 44298.635416666664 | 7.67 |
| 44298.645833333336 | 7.69 |
| 44298.65625 | 7.69 |
| 44298.666666666664 | 7.7 |
| 44298.677083333336 | 7.69 |
| 44298.6875 | 7.7 |
| 44298.697916666664 | 7.69 |
| 44298.708333333336 | 7.69 |
| 44298.71875 | 7.7 |
| 44298.729166666664 | 7.7 |
| 44298.739583333336 | 7.71 |
| 44298.75 | 7.71 |
| 44298.760416666664 | 7.72 |
| 44298.770833333336 | 7.72 |
| 44298.78125 | 7.72 |
| 44298.791666666664 | 7.73 |
| 44298.802083333336 | 7.73 |
| 44298.8125 | 7.74 |
| 44298.822916666664 | 7.74 |
| 44298.833333333336 | 7.73 |
| 44298.84375 | 7.72 |
| 44298.854166666664 | 7.72 |
| 44298.864583333336 | 7.72 |
| 44298.875 | 7.71 |
| 44298.885416666664 | 7.71 |
| 44298.895833333336 | 7.7 |
| 44298.90625 | 7.71 |
| 44298.916666666664 | 7.72 |
| 44298.927083333336 | 7.75 |
| 44298.9375 | 7.76 |
| 44298.947916666664 | 7.76 |
| 44298.958333333336 | 7.77 |
| 44298.96875 | 7.78 |
| 44298.979166666664 | 7.78 |
| 44298.989583333336 | 7.78 |
| 44299.0 | 7.78 |
| 44299.010416666664 | 7.77 |
| 44299.020833333336 | 7.77 |
| 44299.03125 | 7.77 |
| 44299.041666666664 | 7.77 |
| 44299.052083333336 | 7.77 |
| 44299.0625 | 7.76 |
| 44299.072916666664 | 7.76 |
| 44299.083333333336 | 7.76 |
| 44299.09375 | 7.76 |
| 44299.104166666664 | 7.76 |
| 44299.114583333336 | 7.75 |
| 44299.125 | 7.75 |
| 44299.135416666664 | 7.75 |
| 44299.145833333336 | 7.74 |
| 44299.15625 | 7.73 |
| 44299.166666666664 | 7.73 |
| 44299.177083333336 | 7.72 |
| 44299.1875 | 7.72 |
| 44299.197916666664 | 7.7 |
| 44299.208333333336 | 7.68 |
| 44299.21875 | 7.65 |
| 44299.229166666664 | 7.64 |
| 44299.239583333336 | 7.62 |
| 44299.25 | 7.6 |
| 44299.260416666664 | 7.57 |
| 44299.270833333336 | 7.56 |
| 44299.28125 | 7.57 |
| 44299.291666666664 | 7.6 |
| 44299.302083333336 | 7.63 |
| 44299.3125 | 7.65 |
| 44299.322916666664 | 7.64 |
| 44299.333333333336 | 7.63 |
| 44299.34375 | 7.62 |
| 44299.354166666664 | 7.62 |
| 44299.364583333336 | 7.61 |
| 44299.375 | 7.61 |
| 44299.385416666664 | 7.61 |
| 44299.395833333336 | 7.61 |
| 44299.40625 | 7.61 |
| 44299.416666666664 | 7.63 |
| 44299.427083333336 | 7.64 |
| 44299.4375 | 7.65 |
| 44299.447916666664 | 7.66 |
| 44299.458333333336 | 7.67 |
| 44299.46875 | 7.67 |
| 44299.479166666664 | 7.67 |
| 44299.489583333336 | 7.67 |
| 44299.5 | 7.67 |
| 44299.510416666664 | 7.67 |
| 44299.520833333336 | 7.67 |
| 44299.53125 | 7.68 |
| 44299.541666666664 | 7.68 |
| 44299.552083333336 | 7.68 |
| 44299.5625 | 7.68 |
| 44299.572916666664 | 7.69 |
| 44299.583333333336 | 7.69 |
| 44299.59375 | 7.7 |
| 44299.604166666664 | 7.71 |
| 44299.614583333336 | 7.7 |
| 44299.625 | 7.71 |
| 44299.635416666664 | 7.7 |
| 44299.645833333336 | 7.71 |
| 44299.65625 | 7.71 |
| 44299.666666666664 | 7.71 |
| 44299.677083333336 | 7.71 |
| 44299.6875 | 7.71 |
| 44299.697916666664 | 7.72 |
| 44299.708333333336 | 7.71 |
| 44299.71875 | 7.72 |
| 44299.729166666664 | 7.72 |
| 44299.739583333336 | 7.73 |
| 44299.75 | 7.73 |
| 44299.760416666664 | 7.74 |
| 44299.770833333336 | 7.74 |
| 44299.78125 | 7.75 |
| 44299.791666666664 | 7.74 |
| 44299.802083333336 | 7.75 |
| 44299.8125 | 7.75 |
| 44299.822916666664 | 7.73 |
| 44299.833333333336 | 7.71 |
| 44299.84375 | 7.7 |
| 44299.854166666664 | 7.7 |
| 44299.864583333336 | 7.7 |
| 44299.875 | 7.7 |
| 44299.885416666664 | 7.7 |
| 44299.895833333336 | 7.7 |
| 44299.90625 | 7.7 |
| 44299.916666666664 | 7.71 |
| 44299.927083333336 | 7.72 |
| 44299.9375 | 7.74 |
| 44299.947916666664 | 7.76 |
| 44299.958333333336 | 7.76 |
| 44299.96875 | 7.77 |
| 44299.979166666664 | 7.77 |
| 44299.989583333336 | 7.77 |
| 44300.0 | 7.76 |
| 44300.010416666664 | 7.76 |
| 44300.020833333336 | 7.75 |
| 44300.03125 | 7.75 |
| 44300.041666666664 | 7.74 |
| 44300.052083333336 | 7.74 |
| 44300.0625 | 7.74 |
| 44300.072916666664 | 7.74 |
| 44300.083333333336 | 7.74 |
| 44300.09375 | 7.75 |
| 44300.104166666664 | 7.74 |
| 44300.114583333336 | 7.75 |
| 44300.125 | 7.75 |
| 44300.135416666664 | 7.75 |
| 44300.145833333336 | 7.74 |
| 44300.15625 | 7.74 |
| 44300.166666666664 | 7.73 |
| 44300.177083333336 | 7.72 |
| 44300.1875 | 7.71 |
| 44300.197916666664 | 7.7 |
| 44300.208333333336 | 7.69 |
| 44300.21875 | 7.68 |
| 44300.229166666664 | 7.66 |
| 44300.239583333336 | 7.64 |
| 44300.25 | 7.62 |
| 44300.260416666664 | 7.61 |
| 44300.270833333336 | 7.61 |
| 44300.28125 | 7.62 |
| 44300.291666666664 | 7.63 |
| 44300.302083333336 | 7.64 |
| 44300.3125 | 7.65 |
| 44300.322916666664 | 7.65 |
| 44300.333333333336 | 7.64 |
| 44300.34375 | 7.63 |
| 44300.354166666664 | 7.63 |
| 44300.364583333336 | 7.62 |
| 44300.375 | 7.61 |
| 44300.385416666664 | 7.6 |
| 44300.395833333336 | 7.61 |
| 44300.40625 | 7.61 |
| 44300.416666666664 | 7.61 |
| 44300.427083333336 | 7.61 |
| 44300.4375 | 7.62 |
| 44300.447916666664 | 7.63 |
| 44300.458333333336 | 7.64 |
| 44300.46875 | 7.65 |
| 44300.479166666664 | 7.66 |
| 44300.489583333336 | 7.66 |
| 44300.5 | 7.66 |
| 44300.510416666664 | 7.66 |
| 44300.520833333336 | 7.66 |
| 44300.53125 | 7.67 |
| 44300.541666666664 | 7.67 |
| 44300.552083333336 | 7.67 |
| 44300.5625 | 7.68 |
| 44300.572916666664 | 7.68 |
| 44300.583333333336 | 7.68 |
| 44300.59375 | 7.68 |
| 44300.604166666664 | 7.69 |
| 44300.614583333336 | 7.69 |
| 44300.625 | 7.7 |
| 44300.635416666664 | 7.7 |
| 44300.645833333336 | 7.69 |
| 44300.65625 | 7.69 |
| 44300.666666666664 | 7.7 |
| 44300.677083333336 | 7.73 |
| 44300.6875 | 7.74 |
| 44300.697916666664 | 7.76 |
| 44300.708333333336 | 7.76 |
| 44300.71875 | 7.77 |
| 44300.729166666664 | 7.77 |
| 44300.739583333336 | 7.77 |
| 44300.75 | 7.77 |
| 44300.760416666664 | 7.76 |
| 44300.770833333336 | 7.78 |
| 44300.78125 | 7.77 |
| 44300.791666666664 | 7.77 |
| 44300.802083333336 | 7.76 |
| 44300.8125 | 7.74 |
| 44300.822916666664 | 7.73 |
| 44300.833333333336 | 7.72 |
| 44300.84375 | 7.72 |
| 44300.854166666664 | 7.72 |
| 44300.864583333336 | 7.71 |
| 44300.875 | 7.71 |
| 44300.885416666664 | 7.71 |
| 44300.895833333336 | 7.71 |
| 44300.90625 | 7.71 |
| 44300.916666666664 | 7.72 |
| 44300.927083333336 | 7.73 |
| 44300.9375 | 7.74 |
| 44300.947916666664 | 7.75 |
| 44300.958333333336 | 7.75 |
| 44300.96875 | 7.75 |
| 44300.979166666664 | 7.74 |
| 44300.989583333336 | 7.73 |
| 44301.0 | 7.73 |
| 44301.010416666664 | 7.73 |
| 44301.020833333336 | 7.74 |
| 44301.03125 | 7.74 |
| 44301.041666666664 | 7.74 |
| 44301.052083333336 | 7.74 |
| 44301.0625 | 7.75 |
| 44301.072916666664 | 7.75 |
| 44301.083333333336 | 7.75 |
| 44301.09375 | 7.75 |
| 44301.104166666664 | 7.75 |
| 44301.114583333336 | 7.75 |
| 44301.125 | 7.75 |
| 44301.135416666664 | 7.74 |
| 44301.145833333336 | 7.74 |
| 44301.15625 | 7.74 |
| 44301.166666666664 | 7.73 |
| 44301.177083333336 | 7.73 |
| 44301.1875 | 7.73 |
| 44301.197916666664 | 7.72 |
| 44301.208333333336 | 7.71 |
| 44301.21875 | 7.71 |
| 44301.229166666664 | 7.7 |
| 44301.239583333336 | 7.7 |
| 44301.25 | 7.68 |
| 44301.260416666664 | 7.67 |
| 44301.270833333336 | 7.65 |
| 44301.28125 | 7.62 |
| 44301.291666666664 | 7.59 |
| 44301.302083333336 | 7.59 |
| 44301.3125 | 7.58 |
| 44301.322916666664 | 7.57 |
| 44301.333333333336 | 7.64 |
| 44301.34375 | 7.65 |
| 44301.354166666664 | 7.66 |
| 44301.364583333336 | 7.66 |
| 44301.375 | 7.65 |
| 44301.385416666664 | 7.65 |
| 44301.395833333336 | 7.64 |
| 44301.40625 | 7.64 |
| 44301.416666666664 | 7.64 |
| 44301.427083333336 | 7.64 |
| 44301.4375 | 7.63 |
| 44301.447916666664 | 7.63 |
| 44301.458333333336 | 7.63 |
| 44301.46875 | 7.63 |
| 44301.479166666664 | 7.64 |
| 44301.489583333336 | 7.64 |
| 44301.5 | 7.65 |
| 44301.510416666664 | 7.66 |
| 44301.520833333336 | 7.67 |
| 44301.53125 | 7.67 |
| 44301.541666666664 | 7.66 |
| 44301.552083333336 | 7.66 |
| 44301.5625 | 7.66 |
| 44301.572916666664 | 7.66 |
| 44301.583333333336 | 7.67 |
| 44301.59375 | 7.67 |
| 44301.604166666664 | 7.67 |
| 44301.614583333336 | 7.68 |
| 44301.625 | 7.68 |
| 44301.635416666664 | 7.68 |
| 44301.645833333336 | 7.68 |
| 44301.65625 | 7.68 |
| 44301.666666666664 | 7.7 |
| 44301.677083333336 | 7.7 |
| 44301.6875 | 7.69 |
| 44301.697916666664 | 7.7 |
| 44301.708333333336 | 7.71 |
| 44301.71875 | 7.71 |
| 44301.729166666664 | 7.72 |
| 44301.739583333336 | 7.74 |
| 44301.75 | 7.75 |
| 44301.760416666664 | 7.75 |
| 44301.770833333336 | 7.76 |
| 44301.78125 | 7.76 |
| 44301.791666666664 | 7.76 |
| 44301.802083333336 | 7.76 |
| 44301.8125 | 7.76 |
| 44301.822916666664 | 7.77 |
| 44301.833333333336 | 7.76 |
| 44301.84375 | 7.76 |
| 44301.854166666664 | 7.76 |
| 44301.864583333336 | 7.76 |
| 44301.875 | 7.76 |
| 44301.885416666664 | 7.76 |
| 44301.895833333336 | 7.76 |
| 44301.90625 | 7.76 |
| 44301.916666666664 | 7.75 |
| 44301.927083333336 | 7.75 |
| 44301.9375 | 7.74 |
| 44301.947916666664 | 7.74 |
| 44301.958333333336 | 7.75 |
| 44301.96875 | 7.77 |
| 44301.979166666664 | 7.79 |
| 44301.989583333336 | 7.8 |
| 44302.0 | 7.79 |
| 44302.010416666664 | 7.78 |
| 44302.020833333336 | 7.78 |
| 44302.03125 | 7.77 |
| 44302.041666666664 | 7.77 |
| 44302.052083333336 | 7.76 |
| 44302.0625 | 7.75 |
| 44302.072916666664 | 7.75 |
| 44302.083333333336 | 7.75 |
| 44302.09375 | 7.75 |
| 44302.104166666664 | 7.75 |
| 44302.114583333336 | 7.75 |
| 44302.125 | 7.75 |
| 44302.135416666664 | 7.76 |
| 44302.145833333336 | 7.76 |
| 44302.15625 | 7.76 |
| 44302.166666666664 | 7.76 |
| 44302.177083333336 | 7.75 |
| 44302.1875 | 7.75 |
| 44302.197916666664 | 7.75 |
| 44302.208333333336 | 7.75 |
| 44302.21875 | 7.74 |
| 44302.229166666664 | 7.72 |
| 44302.239583333336 | 7.71 |
| 44302.25 | 7.7 |
| 44302.260416666664 | 7.69 |
| 44302.270833333336 | 7.67 |
| 44302.28125 | 7.65 |
| 44302.291666666664 | 7.63 |
| 44302.302083333336 | 7.63 |
| 44302.3125 | 7.62 |
| 44302.322916666664 | 7.63 |
| 44302.333333333336 | 7.67 |
| 44302.34375 | 7.71 |
| 44302.354166666664 | 7.7 |
| 44302.364583333336 | 7.72 |
| 44302.375 | 7.72 |
| 44302.385416666664 | 7.72 |
| 44302.395833333336 | 7.72 |
| 44302.40625 | 7.71 |
| 44302.416666666664 | 7.71 |
| 44302.427083333336 | 7.71 |
| 44302.4375 | 7.7 |
| 44302.447916666664 | 7.7 |
| 44302.458333333336 | 7.7 |
| 44302.46875 | 7.7 |
| 44302.479166666664 | 7.7 |
| 44302.489583333336 | 7.7 |
| 44302.5 | 7.7 |
| 44302.510416666664 | 7.7 |
| 44302.520833333336 | 7.7 |
| 44302.53125 | 7.7 |
| 44302.541666666664 | 7.71 |
| 44302.552083333336 | 7.71 |
| 44302.5625 | 7.71 |
| 44302.572916666664 | 7.71 |
| 44302.583333333336 | 7.71 |
| 44302.59375 | 7.72 |
| 44302.604166666664 | 7.72 |
| 44302.614583333336 | 7.72 |
| 44302.625 | 7.73 |
| 44302.635416666664 | 7.74 |
| 44302.645833333336 | 7.75 |
| 44302.65625 | 7.75 |
| 44302.666666666664 | 7.76 |
| 44302.677083333336 | 7.76 |
| 44302.6875 | 7.77 |
| 44302.697916666664 | 7.77 |
| 44302.708333333336 | 7.76 |
| 44302.71875 | 7.77 |
| 44302.729166666664 | 7.79 |
| 44302.739583333336 | 7.79 |
| 44302.75 | 7.79 |
| 44302.760416666664 | 7.8 |
| 44302.770833333336 | 7.8 |
| 44302.78125 | 7.81 |
| 44302.791666666664 | 7.81 |
| 44302.802083333336 | 7.82 |
| 44302.8125 | 7.82 |
| 44302.822916666664 | 7.82 |
| 44302.833333333336 | 7.82 |
| 44302.84375 | 7.82 |
| 44302.854166666664 | 7.82 |
| 44302.864583333336 | 7.83 |
| 44302.875 | 7.83 |
| 44302.885416666664 | 7.83 |
| 44302.895833333336 | 7.83 |
| 44302.90625 | 7.83 |
| 44302.916666666664 | 7.83 |
| 44302.927083333336 | 7.83 |
| 44302.9375 | 7.82 |
| 44302.947916666664 | 7.81 |
| 44302.958333333336 | 7.81 |
| 44302.96875 | 7.81 |
| 44302.979166666664 | 7.81 |
| 44302.989583333336 | 7.81 |
| 44303.0 | 7.83 |
| 44303.010416666664 | 7.84 |
| 44303.020833333336 | 7.84 |
| 44303.03125 | 7.84 |
| 44303.041666666664 | 7.83 |
| 44303.052083333336 | 7.83 |
| 44303.0625 | 7.82 |
| 44303.072916666664 | 7.82 |
| 44303.083333333336 | 7.82 |
| 44303.09375 | 7.81 |
| 44303.104166666664 | 7.81 |
| 44303.114583333336 | 7.81 |
| 44303.125 | 7.81 |
| 44303.135416666664 | 7.81 |
| 44303.145833333336 | 7.81 |
| 44303.15625 | 7.81 |
| 44303.166666666664 | 7.81 |
| 44303.177083333336 | 7.81 |
| 44303.1875 | 7.8 |
| 44303.197916666664 | 7.79 |
| 44303.208333333336 | 7.8 |
| 44303.21875 | 7.8 |
| 44303.229166666664 | 7.79 |
| 44303.239583333336 | 7.78 |
| 44303.25 | 7.76 |
| 44303.260416666664 | 7.76 |
| 44303.270833333336 | 7.74 |
| 44303.28125 | 7.73 |
| 44303.291666666664 | 7.72 |
| 44303.302083333336 | 7.7 |
| 44303.3125 | 7.68 |
| 44303.322916666664 | 7.67 |
| 44303.333333333336 | 7.69 |
| 44303.34375 | 7.71 |
| 44303.354166666664 | 7.74 |
| 44303.364583333336 | 7.75 |
| 44303.375 | 7.77 |
| 44303.385416666664 | 7.76 |
| 44303.395833333336 | 7.76 |
| 44303.40625 | 7.75 |
| 44303.416666666664 | 7.75 |
| 44303.427083333336 | 7.75 |
| 44303.4375 | 7.74 |
| 44303.447916666664 | 7.74 |
| 44303.458333333336 | 7.74 |
| 44303.46875 | 7.74 |
| 44303.479166666664 | 7.74 |
| 44303.489583333336 | 7.74 |
| 44303.5 | 7.73 |
| 44303.510416666664 | 7.73 |
| 44303.520833333336 | 7.73 |
| 44303.53125 | 7.73 |
| 44303.541666666664 | 7.73 |
| 44303.552083333336 | 7.73 |
| 44303.5625 | 7.73 |
| 44303.572916666664 | 7.73 |
| 44303.583333333336 | 7.74 |
| 44303.59375 | 7.74 |
| 44303.604166666664 | 7.74 |
| 44303.614583333336 | 7.75 |
| 44303.625 | 7.75 |
| 44303.635416666664 | 7.75 |
| 44303.645833333336 | 7.75 |
| 44303.65625 | 7.75 |
| 44303.666666666664 | 7.76 |
| 44303.677083333336 | 7.76 |
| 44303.6875 | 7.76 |
| 44303.697916666664 | 7.77 |
| 44303.708333333336 | 7.77 |
| 44303.71875 | 7.76 |
| 44303.729166666664 | 7.77 |
| 44303.739583333336 | 7.78 |
| 44303.75 | 7.79 |
| 44303.760416666664 | 7.79 |
| 44303.770833333336 | 7.8 |
| 44303.78125 | 7.81 |
| 44303.791666666664 | 7.82 |
| 44303.802083333336 | 7.82 |
| 44303.8125 | 7.82 |
| 44303.822916666664 | 7.83 |
| 44303.833333333336 | 7.83 |
| 44303.84375 | 7.84 |
| 44303.854166666664 | 7.84 |
| 44303.864583333336 | 7.85 |
| 44303.875 | 7.85 |
| 44303.885416666664 | 7.85 |
| 44303.895833333336 | 7.85 |
| 44303.90625 | 7.85 |
| 44303.916666666664 | 7.85 |
| 44303.927083333336 | 7.85 |
| 44303.9375 | 7.85 |
| 44303.947916666664 | 7.84 |
| 44303.958333333336 | 7.83 |
| 44303.96875 | 7.83 |
| 44303.979166666664 | 7.83 |
| 44303.989583333336 | 7.82 |
| 44304.0 | 7.82 |
| 44304.010416666664 | 7.82 |
| 44304.020833333336 | 7.82 |
| 44304.03125 | 7.82 |
| 44304.041666666664 | 7.83 |
| 44304.052083333336 | 7.82 |
| 44304.0625 | 7.82 |
| 44304.072916666664 | 7.81 |
| 44304.083333333336 | 7.8 |
| 44304.09375 | 7.8 |
| 44304.104166666664 | 7.79 |
| 44304.114583333336 | 7.79 |
| 44304.125 | 7.79 |
| 44304.135416666664 | 7.79 |
| 44304.145833333336 | 7.79 |
| 44304.15625 | 7.79 |
| 44304.166666666664 | 7.79 |
| 44304.177083333336 | 7.79 |
| 44304.1875 | 7.79 |
| 44304.197916666664 | 7.78 |
| 44304.208333333336 | 7.78 |
| 44304.21875 | 7.78 |
| 44304.229166666664 | 7.77 |
| 44304.239583333336 | 7.77 |
| 44304.25 | 7.78 |
| 44304.260416666664 | 7.77 |
| 44304.270833333336 | 7.77 |
| 44304.28125 | 7.76 |
| 44304.291666666664 | 7.75 |
| 44304.302083333336 | 7.74 |
| 44304.3125 | 7.72 |
| 44304.322916666664 | 7.71 |
| 44304.333333333336 | 7.69 |
| 44304.34375 | 7.68 |
| 44304.354166666664 | 7.66 |
| 44304.364583333336 | 7.65 |
| 44304.375 | 7.7 |
| 44304.385416666664 | 7.7 |
| 44304.395833333336 | 7.74 |
| 44304.40625 | 7.75 |
| 44304.416666666664 | 7.75 |
| 44304.427083333336 | 7.76 |
| 44304.4375 | 7.76 |
| 44304.447916666664 | 7.75 |
| 44304.458333333336 | 7.75 |
| 44304.46875 | 7.75 |
| 44304.479166666664 | 7.75 |
| 44304.489583333336 | 7.75 |
| 44304.5 | 7.75 |
| 44304.510416666664 | 7.74 |
| 44304.520833333336 | 7.74 |
| 44304.53125 | 7.73 |
| 44304.541666666664 | 7.73 |
| 44304.552083333336 | 7.73 |
| 44304.5625 | 7.72 |
| 44304.572916666664 | 7.72 |
| 44304.583333333336 | 7.72 |
| 44304.59375 | 7.73 |
| 44304.604166666664 | 7.73 |
| 44304.614583333336 | 7.74 |
| 44304.625 | 7.74 |
| 44304.635416666664 | 7.74 |
| 44304.645833333336 | 7.74 |
| 44304.65625 | 7.74 |
| 44304.666666666664 | 7.74 |
| 44304.677083333336 | 7.74 |
| 44304.6875 | 7.74 |
| 44304.697916666664 | 7.74 |
| 44304.708333333336 | 7.74 |
| 44304.71875 | 7.75 |
| 44304.729166666664 | 7.74 |
| 44304.739583333336 | 7.75 |
| 44304.75 | 7.74 |
| 44304.760416666664 | 7.75 |
| 44304.770833333336 | 7.77 |
| 44304.78125 | 7.77 |
| 44304.791666666664 | 7.79 |
| 44304.802083333336 | 7.79 |
| 44304.8125 | 7.8 |
| 44304.822916666664 | 7.81 |
| 44304.833333333336 | 7.81 |
| 44304.84375 | 7.82 |
| 44304.854166666664 | 7.83 |
| 44304.864583333336 | 7.83 |
| 44304.875 | 7.83 |
| 44304.885416666664 | 7.84 |
| 44304.895833333336 | 7.84 |
| 44304.90625 | 7.84 |
| 44304.916666666664 | 7.84 |
| 44304.927083333336 | 7.84 |
| 44304.9375 | 7.85 |
| 44304.947916666664 | 7.85 |
| 44304.958333333336 | 7.85 |
| 44304.96875 | 7.85 |
| 44304.979166666664 | 7.84 |
| 44304.989583333336 | 7.84 |
| 44305.0 | 7.82 |
| 44305.010416666664 | 7.81 |
| 44305.020833333336 | 7.81 |
| 44305.03125 | 7.81 |
| 44305.041666666664 | 7.81 |
| 44305.052083333336 | 7.81 |
| 44305.0625 | 7.81 |
| 44305.072916666664 | 7.81 |
| 44305.083333333336 | 7.8 |
| 44305.09375 | 7.79 |
| 44305.104166666664 | 7.79 |
| 44305.114583333336 | 7.78 |
| 44305.125 | 7.77 |
| 44305.135416666664 | 7.77 |
| 44305.145833333336 | 7.76 |
| 44305.15625 | 7.76 |
| 44305.166666666664 | 7.77 |
| 44305.177083333336 | 7.77 |
| 44305.1875 | 7.77 |
| 44305.197916666664 | 7.78 |
| 44305.208333333336 | 7.78 |
| 44305.21875 | 7.78 |
| 44305.229166666664 | 7.78 |
| 44305.239583333336 | 7.77 |
| 44305.25 | 7.77 |
| 44305.260416666664 | 7.76 |
| 44305.270833333336 | 7.76 |
| 44305.28125 | 7.76 |
| 44305.291666666664 | 7.75 |
| 44305.302083333336 | 7.74 |
| 44305.3125 | 7.73 |
| 44305.322916666664 | 7.71 |
| 44305.333333333336 | 7.7 |
| 44305.34375 | 7.68 |
| 44305.354166666664 | 7.66 |
| 44305.364583333336 | 7.66 |
| 44305.375 | 7.64 |
| 44305.385416666664 | 7.63 |
| 44305.395833333336 | 7.7 |
| 44305.40625 | 7.7 |
| 44305.416666666664 | 7.73 |
| 44305.427083333336 | 7.74 |
| 44305.4375 | 7.73 |
| 44305.447916666664 | 7.74 |
| 44305.458333333336 | 7.73 |
| 44305.46875 | 7.73 |
| 44305.479166666664 | 7.72 |
| 44305.489583333336 | 7.73 |
| 44305.5 | 7.72 |
| 44305.510416666664 | 7.72 |
| 44305.520833333336 | 7.72 |
| 44305.53125 | 7.72 |
| 44305.541666666664 | 7.72 |
| 44305.552083333336 | 7.72 |
| 44305.5625 | 7.71 |
| 44305.572916666664 | 7.71 |
| 44305.583333333336 | 7.71 |
| 44305.59375 | 7.71 |
| 44305.604166666664 | 7.71 |
| 44305.614583333336 | 7.71 |
| 44305.625 | 7.71 |
| 44305.635416666664 | 7.72 |
| 44305.645833333336 | 7.72 |
| 44305.65625 | 7.72 |
| 44305.666666666664 | 7.72 |
| 44305.677083333336 | 7.71 |
| 44305.6875 | 7.72 |
| 44305.697916666664 | 7.72 |
| 44305.708333333336 | 7.71 |
| 44305.71875 | 7.71 |
| 44305.729166666664 | 7.71 |
| 44305.739583333336 | 7.71 |
| 44305.75 | 7.71 |
| 44305.760416666664 | 7.71 |
| 44305.770833333336 | 7.72 |
| 44305.78125 | 7.72 |
| 44305.791666666664 | 7.72 |
| 44305.802083333336 | 7.72 |
| 44305.8125 | 7.73 |
| 44305.822916666664 | 7.72 |
| 44305.833333333336 | 7.73 |
| 44305.84375 | 7.73 |
| 44305.854166666664 | 7.73 |
| 44305.864583333336 | 7.74 |
| 44305.875 | 7.74 |
| 44305.885416666664 | 7.76 |
| 44305.895833333336 | 7.78 |
| 44305.90625 | 7.78 |
| 44305.916666666664 | 7.78 |
| 44305.927083333336 | 7.78 |
| 44305.9375 | 7.78 |
| 44305.947916666664 | 7.78 |
| 44305.958333333336 | 7.78 |
| 44305.96875 | 7.77 |
| 44305.979166666664 | 7.77 |
| 44305.989583333336 | 7.77 |
| 44306.0 | 7.76 |
| 44306.010416666664 | 7.76 |
| 44306.020833333336 | 7.76 |
| 44306.03125 | 7.76 |
| 44306.041666666664 | 7.76 |
| 44306.052083333336 | 7.76 |
| 44306.0625 | 7.76 |
| 44306.072916666664 | 7.76 |
| 44306.083333333336 | 7.75 |
| 44306.09375 | 7.75 |
| 44306.104166666664 | 7.74 |
| 44306.114583333336 | 7.74 |
| 44306.125 | 7.74 |
| 44306.135416666664 | 7.73 |
| 44306.145833333336 | 7.73 |
| 44306.15625 | 7.73 |
| 44306.166666666664 | 7.73 |
| 44306.177083333336 | 7.73 |
| 44306.1875 | 7.72 |
| 44306.197916666664 | 7.72 |
| 44306.208333333336 | 7.72 |
| 44306.21875 | 7.71 |
| 44306.229166666664 | 7.71 |
| 44306.239583333336 | 7.71 |
| 44306.25 | 7.7 |
| 44306.260416666664 | 7.7 |
| 44306.270833333336 | 7.7 |
| 44306.28125 | 7.7 |
| 44306.291666666664 | 7.7 |
| 44306.302083333336 | 7.7 |
| 44306.3125 | 7.7 |
| 44306.322916666664 | 7.69 |
| 44306.333333333336 | 7.7 |
| 44306.34375 | 7.69 |
| 44306.354166666664 | 7.68 |
| 44306.364583333336 | 7.66 |
| 44306.375 | 7.66 |
| 44306.385416666664 | 7.65 |
| 44306.395833333336 | 7.62 |
| 44306.40625 | 7.61 |
| 44306.416666666664 | 7.6 |
| 44306.427083333336 | 7.57 |
| 44306.4375 | 7.57 |
| 44306.447916666664 | 7.58 |
| 44306.458333333336 | 7.67 |
| 44306.46875 | 7.66 |
| 44306.479166666664 | 7.66 |
| 44306.489583333336 | 7.66 |
| 44306.5 | 7.66 |
| 44306.510416666664 | 7.65 |
| 44306.520833333336 | 7.65 |
| 44306.53125 | 7.66 |
| 44306.541666666664 | 7.66 |
| 44306.552083333336 | 7.66 |
| 44306.5625 | 7.65 |
| 44306.572916666664 | 7.65 |
| 44306.583333333336 | 7.65 |
| 44306.59375 | 7.65 |
| 44306.604166666664 | 7.65 |
| 44306.614583333336 | 7.65 |
| 44306.625 | 7.65 |
| 44306.635416666664 | 7.65 |
| 44306.645833333336 | 7.66 |
| 44306.65625 | 7.66 |
| 44306.666666666664 | 7.67 |
| 44306.677083333336 | 7.69 |
| 44306.6875 | 7.7 |
| 44306.697916666664 | 7.71 |
| 44306.708333333336 | 7.72 |
| 44306.71875 | 7.72 |
| 44306.729166666664 | 7.72 |
| 44306.739583333336 | 7.72 |
| 44306.75 | 7.72 |
| 44306.760416666664 | 7.73 |
| 44306.770833333336 | 7.73 |
| 44306.78125 | 7.73 |
| 44306.791666666664 | 7.74 |
| 44306.802083333336 | 7.73 |
| 44306.8125 | 7.74 |
| 44306.822916666664 | 7.74 |
| 44306.833333333336 | 7.73 |
| 44306.84375 | 7.73 |
| 44306.854166666664 | 7.74 |
| 44306.864583333336 | 7.74 |
| 44306.875 | 7.78 |
| 44306.885416666664 | 7.79 |
| 44306.895833333336 | 7.8 |
| 44306.90625 | 7.8 |
| 44306.916666666664 | 7.79 |
| 44306.927083333336 | 7.79 |
| 44306.9375 | 7.79 |
| 44306.947916666664 | 7.79 |
| 44306.958333333336 | 7.79 |
| 44306.96875 | 7.8 |
| 44306.979166666664 | 7.82 |
| 44306.989583333336 | 7.83 |
| 44307.0 | 7.83 |
| 44307.010416666664 | 7.83 |
| 44307.020833333336 | 7.83 |
| 44307.03125 | 7.83 |
| 44307.041666666664 | 7.83 |
| 44307.052083333336 | 7.83 |
| 44307.0625 | 7.82 |
| 44307.072916666664 | 7.82 |
| 44307.083333333336 | 7.8 |
| 44307.09375 | 7.77 |
| 44307.104166666664 | 7.78 |
| 44307.114583333336 | 7.77 |
| 44307.125 | 7.76 |
| 44307.135416666664 | 7.77 |
| 44307.145833333336 | 7.78 |
| 44307.15625 | 7.78 |
| 44307.166666666664 | 7.78 |
| 44307.177083333336 | 7.78 |
| 44307.1875 | 7.78 |
| 44307.197916666664 | 7.79 |
| 44307.208333333336 | 7.79 |
| 44307.21875 | 7.79 |
| 44307.229166666664 | 7.79 |
| 44307.239583333336 | 7.8 |
| 44307.25 | 7.8 |
| 44307.260416666664 | 7.8 |
| 44307.270833333336 | 7.8 |
| 44307.28125 | 7.8 |
| 44307.291666666664 | 7.8 |
| 44307.302083333336 | 7.79 |
| 44307.3125 | 7.79 |
| 44307.322916666664 | 7.78 |
| 44307.333333333336 | 7.77 |
| 44307.34375 | 7.78 |
| 44307.354166666664 | 7.78 |
| 44307.364583333336 | 7.77 |
| 44307.375 | 7.77 |
| 44307.385416666664 | 7.75 |
| 44307.395833333336 | 7.74 |
| 44307.40625 | 7.73 |
| 44307.416666666664 | 7.73 |
| 44307.427083333336 | 7.7 |
| 44307.4375 | 7.69 |
| 44307.447916666664 | 7.69 |
| 44307.458333333336 | 7.68 |
| 44307.46875 | 7.72 |
| 44307.479166666664 | 7.73 |
| 44307.489583333336 | 7.73 |
| 44307.5 | 7.72 |
| 44307.510416666664 | 7.71 |
| 44307.520833333336 | 7.71 |
| 44307.53125 | 7.71 |
| 44307.541666666664 | 7.71 |
| 44307.552083333336 | 7.71 |
| 44307.5625 | 7.72 |
| 44307.572916666664 | 7.72 |
| 44307.583333333336 | 7.72 |
| 44307.59375 | 7.72 |
| 44307.604166666664 | 7.71 |
| 44307.614583333336 | 7.71 |
| 44307.625 | 7.71 |
| 44307.635416666664 | 7.72 |
| 44307.645833333336 | 7.72 |
| 44307.65625 | 7.72 |
| 44307.666666666664 | 7.73 |
| 44307.677083333336 | 7.75 |
| 44307.6875 | 7.76 |
| 44307.697916666664 | 7.76 |
| 44307.708333333336 | 7.77 |
| 44307.71875 | 7.78 |
| 44307.729166666664 | 7.78 |
| 44307.739583333336 | 7.78 |
| 44307.75 | 7.78 |
| 44307.760416666664 | 7.78 |
| 44307.770833333336 | 7.79 |
| 44307.78125 | 7.79 |
| 44307.791666666664 | 7.8 |
| 44307.802083333336 | 7.8 |
| 44307.8125 | 7.79 |
| 44307.822916666664 | 7.79 |
| 44307.833333333336 | 7.79 |
| 44307.84375 | 7.79 |
| 44307.854166666664 | 7.79 |
| 44307.864583333336 | 7.79 |
| 44307.875 | 7.79 |
| 44307.885416666664 | 7.79 |
| 44307.895833333336 | 7.79 |
| 44307.90625 | 7.79 |
| 44307.916666666664 | 7.79 |
| 44307.927083333336 | 7.79 |
| 44307.9375 | 7.79 |
| 44307.947916666664 | 7.79 |
| 44307.958333333336 | 7.8 |
| 44307.96875 | 7.82 |
| 44307.979166666664 | 7.82 |
| 44307.989583333336 | 7.82 |
| 44308.0 | 7.81 |
| 44308.010416666664 | 7.8 |
| 44308.020833333336 | 7.79 |
| 44308.03125 | 7.79 |
| 44308.041666666664 | 7.79 |
| 44308.052083333336 | 7.79 |
| 44308.0625 | 7.78 |
| 44308.072916666664 | 7.78 |
| 44308.083333333336 | 7.78 |
| 44308.09375 | 7.78 |
| 44308.104166666664 | 7.78 |
| 44308.114583333336 | 7.78 |
| 44308.125 | 7.78 |
| 44308.135416666664 | 7.77 |
| 44308.145833333336 | 7.76 |
| 44308.15625 | 7.76 |
| 44308.166666666664 | 7.77 |
| 44308.177083333336 | 7.78 |
| 44308.1875 | 7.79 |
| 44308.197916666664 | 7.79 |
| 44308.208333333336 | 7.78 |
| 44308.21875 | 7.78 |
| 44308.229166666664 | 7.78 |
| 44308.239583333336 | 7.78 |
| 44308.25 | 7.78 |
| 44308.260416666664 | 7.78 |
| 44308.270833333336 | 7.78 |
| 44308.28125 | 7.78 |
| 44308.291666666664 | 7.78 |
| 44308.302083333336 | 7.78 |
| 44308.3125 | 7.78 |
| 44308.322916666664 | 7.77 |
| 44308.333333333336 | 7.77 |
| 44308.34375 | 7.77 |
| 44308.354166666664 | 7.77 |
| 44308.364583333336 | 7.77 |
| 44308.375 | 7.76 |
| 44308.385416666664 | 7.77 |
| 44308.395833333336 | 7.76 |
| 44308.40625 | 7.76 |
| 44308.416666666664 | 7.76 |
| 44308.427083333336 | 7.75 |
| 44308.4375 | 7.76 |
| 44308.447916666664 | 7.76 |
| 44308.458333333336 | 7.75 |
| 44308.46875 | 7.76 |
| 44308.479166666664 | 7.75 |
| 44308.489583333336 | 7.76 |
| 44308.5 | 7.77 |
| 44308.510416666664 | 7.77 |
| 44308.520833333336 | 7.77 |
| 44308.53125 | 7.77 |
| 44308.541666666664 | 7.77 |
| 44308.552083333336 | 7.77 |
| 44308.5625 | 7.77 |
| 44308.572916666664 | 7.76 |
| 44308.583333333336 | 7.77 |
| 44308.59375 | 7.77 |
| 44308.604166666664 | 7.77 |
| 44308.614583333336 | 7.78 |
| 44308.625 | 7.78 |
| 44308.635416666664 | 7.78 |
| 44308.645833333336 | 7.79 |
| 44308.65625 | 7.79 |
| 44308.666666666664 | 7.79 |
| 44308.677083333336 | 7.78 |
| 44308.6875 | 7.78 |
| 44308.697916666664 | 7.78 |
| 44308.708333333336 | 7.78 |
| 44308.71875 | 7.79 |
| 44308.729166666664 | 7.8 |
| 44308.739583333336 | 7.8 |
| 44308.75 | 7.8 |
| 44308.760416666664 | 7.81 |
| 44308.770833333336 | 7.81 |
| 44308.78125 | 7.82 |
| 44308.791666666664 | 7.82 |
| 44308.802083333336 | 7.82 |
| 44308.8125 | 7.82 |
| 44308.822916666664 | 7.81 |
| 44308.833333333336 | 7.81 |
| 44308.84375 | 7.81 |
| 44308.854166666664 | 7.81 |
| 44308.864583333336 | 7.81 |
| 44308.875 | 7.81 |
| 44308.885416666664 | 7.81 |
| 44308.895833333336 | 7.81 |
| 44308.90625 | 7.81 |
| 44308.916666666664 | 7.82 |
| 44308.927083333336 | 7.82 |
| 44308.9375 | 7.82 |
| 44308.947916666664 | 7.82 |
| 44308.958333333336 | 7.82 |
| 44308.96875 | 7.82 |
| 44308.979166666664 | 7.82 |
| 44308.989583333336 | 7.82 |
| 44309.0 | 7.83 |
| 44309.010416666664 | 7.85 |
| 44309.020833333336 | 7.85 |
| 44309.03125 | 7.86 |
| 44309.041666666664 | 7.86 |
| 44309.052083333336 | 7.85 |
| 44309.0625 | 7.85 |
| 44309.072916666664 | 7.85 |
| 44309.083333333336 | 7.86 |
| 44309.09375 | 7.85 |
| 44309.104166666664 | 7.85 |
| 44309.114583333336 | 7.85 |
| 44309.125 | 7.84 |
| 44309.135416666664 | 7.84 |
| 44309.145833333336 | 7.84 |
| 44309.15625 | 7.82 |
| 44309.166666666664 | 7.84 |
| 44309.177083333336 | 7.83 |
| 44309.1875 | 7.83 |
| 44309.197916666664 | 7.83 |
| 44309.208333333336 | 7.82 |
| 44309.21875 | 7.82 |
| 44309.229166666664 | 7.81 |
| 44309.239583333336 | 7.81 |
| 44309.25 | 7.81 |
| 44309.260416666664 | 7.8 |
| 44309.270833333336 | 7.8 |
| 44309.28125 | 7.79 |
| 44309.291666666664 | 7.78 |
| 44309.302083333336 | 7.78 |
| 44309.3125 | 7.77 |
| 44309.322916666664 | 7.76 |
| 44309.333333333336 | 7.75 |
| 44309.34375 | 7.75 |
| 44309.354166666664 | 7.74 |
| 44309.364583333336 | 7.74 |
| 44309.375 | 7.74 |
| 44309.385416666664 | 7.75 |
| 44309.395833333336 | 7.75 |
| 44309.40625 | 7.75 |
| 44309.416666666664 | 7.74 |
| 44309.427083333336 | 7.74 |
| 44309.4375 | 7.76 |
| 44309.447916666664 | 7.75 |
| 44309.458333333336 | 7.74 |
| 44309.46875 | 7.73 |
| 44309.479166666664 | 7.72 |
| 44309.489583333336 | 7.72 |
| 44309.5 | 7.72 |
| 44309.510416666664 | 7.72 |
| 44309.520833333336 | 7.75 |
| 44309.53125 | 7.77 |
| 44309.541666666664 | 7.77 |
| 44309.552083333336 | 7.78 |
| 44309.5625 | 7.77 |
| 44309.572916666664 | 7.78 |
| 44309.583333333336 | 7.77 |
| 44309.59375 | 7.78 |
| 44309.604166666664 | 7.77 |
| 44309.614583333336 | 7.63 |
| 44309.625 | 7.66 |
| 44309.635416666664 | 7.67 |
| 44309.645833333336 | 7.68 |
| 44309.65625 | 7.69 |
| 44309.666666666664 | 7.7 |
| 44309.677083333336 | 7.72 |
| 44309.6875 | 7.71 |
| 44309.697916666664 | 7.7 |
| 44309.708333333336 | 7.72 |
| 44309.71875 | 7.72 |
| 44309.729166666664 | 7.72 |
| 44309.739583333336 | 7.71 |
| 44309.75 | 7.71 |
| 44309.760416666664 | 7.71 |
| 44309.770833333336 | 7.72 |
| 44309.78125 | 7.72 |
| 44309.791666666664 | 7.73 |
| 44309.802083333336 | 7.75 |
| 44309.8125 | 7.76 |
| 44309.822916666664 | 7.76 |
| 44309.833333333336 | 7.75 |
| 44309.84375 | 7.74 |
| 44309.854166666664 | 7.73 |
| 44309.864583333336 | 7.72 |
| 44309.875 | 7.73 |
| 44309.885416666664 | 7.73 |
| 44309.895833333336 | 7.74 |
| 44309.90625 | 7.74 |
| 44309.916666666664 | 7.74 |
| 44309.927083333336 | 7.74 |
| 44309.9375 | 7.74 |
| 44309.947916666664 | 7.75 |
| 44309.958333333336 | 7.74 |
| 44309.96875 | 7.74 |
| 44309.979166666664 | 7.74 |
| 44309.989583333336 | 7.74 |
| 44310.0 | 7.74 |
| 44310.010416666664 | 7.74 |
| 44310.020833333336 | 7.74 |
| 44310.03125 | 7.74 |
| 44310.041666666664 | 7.73 |
| 44310.052083333336 | 7.75 |
| 44310.0625 | 7.77 |
| 44310.072916666664 | 7.76 |
| 44310.083333333336 | 7.77 |
| 44310.09375 | 7.77 |
| 44310.104166666664 | 7.77 |
| 44310.114583333336 | 7.77 |
| 44310.125 | 7.77 |
| 44310.135416666664 | 7.77 |
| 44310.145833333336 | 7.76 |
| 44310.15625 | 7.77 |
| 44310.166666666664 | 7.77 |
| 44310.177083333336 | 7.76 |
| 44310.1875 | 7.77 |
| 44310.197916666664 | 7.77 |
| 44310.208333333336 | 7.75 |
| 44310.21875 | 7.74 |
| 44310.229166666664 | 7.75 |
| 44310.239583333336 | 7.75 |
| 44310.25 | 7.75 |
| 44310.260416666664 | 7.74 |
| 44310.270833333336 | 7.74 |
| 44310.28125 | 7.74 |
| 44310.291666666664 | 7.73 |
| 44310.302083333336 | 7.73 |
| 44310.3125 | 7.73 |
| 44310.322916666664 | 7.72 |
| 44310.333333333336 | 7.7 |
| 44310.34375 | 7.69 |
| 44310.354166666664 | 7.68 |
| 44310.364583333336 | 7.67 |
| 44310.375 | 7.67 |
| 44310.385416666664 | 7.67 |
| 44310.395833333336 | 7.68 |
| 44310.40625 | 7.69 |
| 44310.416666666664 | 7.7 |
| 44310.427083333336 | 7.7 |
| 44310.4375 | 7.7 |
| 44310.447916666664 | 7.7 |
| 44310.458333333336 | 7.7 |
| 44310.46875 | 7.69 |
| 44310.479166666664 | 7.69 |
| 44310.489583333336 | 7.69 |
| 44310.5 | 7.68 |
| 44310.510416666664 | 7.67 |
| 44310.520833333336 | 7.67 |
| 44310.53125 | 7.67 |
| 44310.541666666664 | 7.67 |
| 44310.552083333336 | 7.67 |
| 44310.5625 | 7.67 |
| 44310.572916666664 | 7.68 |
| 44310.583333333336 | 7.69 |
| 44310.59375 | 7.71 |
| 44310.604166666664 | 7.71 |
| 44310.614583333336 | 7.72 |
| 44310.625 | 7.72 |
| 44310.635416666664 | 7.73 |
| 44310.645833333336 | 7.73 |
| 44310.65625 | 7.73 |
| 44310.666666666664 | 7.74 |
| 44310.677083333336 | 7.74 |
| 44310.6875 | 7.74 |
| 44310.697916666664 | 7.75 |
| 44310.708333333336 | 7.75 |
| 44310.71875 | 7.74 |
| 44310.729166666664 | 7.74 |
| 44310.739583333336 | 7.73 |
| 44310.75 | 7.74 |
| 44310.760416666664 | 7.74 |
| 44310.770833333336 | 7.74 |
| 44310.78125 | 7.74 |
| 44310.791666666664 | 7.75 |
| 44310.802083333336 | 7.76 |
| 44310.8125 | 7.76 |
| 44310.822916666664 | 7.75 |
| 44310.833333333336 | 7.75 |
| 44310.84375 | 7.74 |
| 44310.854166666664 | 7.73 |
| 44310.864583333336 | 7.72 |
| 44310.875 | 7.72 |
| 44310.885416666664 | 7.73 |
| 44310.895833333336 | 7.73 |
| 44310.90625 | 7.73 |
| 44310.916666666664 | 7.73 |
| 44310.927083333336 | 7.74 |
| 44310.9375 | 7.74 |
| 44310.947916666664 | 7.75 |
| 44310.958333333336 | 7.74 |
| 44310.96875 | 7.74 |
| 44310.979166666664 | 7.74 |
| 44310.989583333336 | 7.74 |
| 44311.0 | 7.73 |
| 44311.010416666664 | 7.73 |
| 44311.020833333336 | 7.72 |
| 44311.03125 | 7.71 |
| 44311.041666666664 | 7.7 |
| 44311.052083333336 | 7.69 |
| 44311.0625 | 7.68 |
| 44311.072916666664 | 7.68 |
| 44311.083333333336 | 7.66 |
| 44311.09375 | 7.65 |
| 44311.104166666664 | 7.65 |
| 44311.114583333336 | 7.68 |
| 44311.125 | 7.71 |
| 44311.135416666664 | 7.71 |
| 44311.145833333336 | 7.71 |
| 44311.15625 | 7.71 |
| 44311.166666666664 | 7.71 |
| 44311.177083333336 | 7.69 |
| 44311.1875 | 7.67 |
| 44311.197916666664 | 7.65 |
| 44311.208333333336 | 7.67 |
| 44311.21875 | 7.68 |
| 44311.229166666664 | 7.7 |
| 44311.239583333336 | 7.68 |
| 44311.25 | 7.68 |
| 44311.260416666664 | 7.69 |
| 44311.270833333336 | 7.69 |
| 44311.28125 | 7.69 |
| 44311.291666666664 | 7.69 |
| 44311.302083333336 | 7.7 |
| 44311.3125 | 7.69 |
| 44311.322916666664 | 7.69 |
| 44311.333333333336 | 7.7 |
| 44311.34375 | 7.7 |
| 44311.354166666664 | 7.69 |
| 44311.364583333336 | 7.7 |
| 44311.375 | 7.69 |
| 44311.385416666664 | 7.7 |
| 44311.395833333336 | 7.7 |
| 44311.40625 | 7.7 |
| 44311.416666666664 | 7.71 |
| 44311.427083333336 | 7.71 |
| 44311.4375 | 7.71 |
| 44311.447916666664 | 7.72 |
| 44311.458333333336 | 7.71 |
| 44311.46875 | 7.72 |
| 44311.479166666664 | 7.72 |
| 44311.489583333336 | 7.72 |
| 44311.5 | 7.72 |
| 44311.510416666664 | 7.71 |
| 44311.520833333336 | 7.71 |
| 44311.53125 | 7.71 |
| 44311.541666666664 | 7.71 |
| 44311.552083333336 | 7.71 |
| 44311.5625 | 7.7 |
| 44311.572916666664 | 7.7 |
| 44311.583333333336 | 7.69 |
| 44311.59375 | 7.68 |
| 44311.604166666664 | 7.67 |
| 44311.614583333336 | 7.67 |
| 44311.625 | 7.66 |
| 44311.635416666664 | 7.66 |
| 44311.645833333336 | 7.66 |
| 44311.65625 | 7.65 |
| 44311.666666666664 | 7.67 |
| 44311.677083333336 | 7.68 |
| 44311.6875 | 7.68 |
| 44311.697916666664 | 7.68 |
| 44311.708333333336 | 7.68 |
| 44311.71875 | 7.68 |
| 44311.729166666664 | 7.68 |
| 44311.739583333336 | 7.69 |
| 44311.75 | 7.69 |
| 44311.760416666664 | 7.69 |
| 44311.770833333336 | 7.68 |
| 44311.78125 | 7.68 |
| 44311.791666666664 | 7.68 |
| 44311.802083333336 | 7.69 |
| 44311.8125 | 7.7 |
| 44311.822916666664 | 7.7 |
| 44311.833333333336 | 7.71 |
| 44311.84375 | 7.72 |
| 44311.854166666664 | 7.72 |
| 44311.864583333336 | 7.72 |
| 44311.875 | 7.72 |
| 44311.885416666664 | 7.72 |
| 44311.895833333336 | 7.73 |
| 44311.90625 | 7.73 |
| 44311.916666666664 | 7.75 |
| 44311.927083333336 | 7.75 |
| 44311.9375 | 7.75 |
| 44311.947916666664 | 7.76 |
| 44311.958333333336 | 7.76 |
| 44311.96875 | 7.75 |
| 44311.979166666664 | 7.75 |
| 44311.989583333336 | 7.75 |
| 44312.0 | 7.76 |
| 44312.010416666664 | 7.76 |
| 44312.020833333336 | 7.76 |
| 44312.03125 | 7.76 |
| 44312.041666666664 | 7.75 |
| 44312.052083333336 | 7.76 |
| 44312.0625 | 7.75 |
| 44312.072916666664 | 7.74 |
| 44312.083333333336 | 7.73 |
| 44312.09375 | 7.73 |
| 44312.104166666664 | 7.72 |
| 44312.114583333336 | 7.71 |
| 44312.125 | 7.69 |
| 44312.135416666664 | 7.68 |
| 44312.145833333336 | 7.65 |
| 44312.15625 | 7.62 |
| 44312.166666666664 | 7.6 |
| 44312.177083333336 | 7.58 |
| 44312.1875 | 7.59 |
| 44312.197916666664 | 7.64 |
| 44312.208333333336 | 7.66 |
| 44312.21875 | 7.65 |
| 44312.229166666664 | 7.65 |
| 44312.239583333336 | 7.63 |
| 44312.25 | 7.61 |
| 44312.260416666664 | 7.59 |
| 44312.270833333336 | 7.57 |
| 44312.28125 | 7.55 |
| 44312.291666666664 | 7.55 |
| 44312.302083333336 | 7.56 |
| 44312.3125 | 7.56 |
| 44312.322916666664 | 7.57 |
| 44312.333333333336 | 7.58 |
| 44312.34375 | 7.6 |
| 44312.354166666664 | 7.62 |
| 44312.364583333336 | 7.62 |
| 44312.375 | 7.63 |
| 44312.385416666664 | 7.64 |
| 44312.395833333336 | 7.64 |
| 44312.40625 | 7.65 |
| 44312.416666666664 | 7.66 |
| 44312.427083333336 | 7.66 |
| 44312.4375 | 7.67 |
| 44312.447916666664 | 7.68 |
| 44312.458333333336 | 7.7 |
| 44312.46875 | 7.71 |
| 44312.479166666664 | 7.71 |
| 44312.489583333336 | 7.72 |
| 44312.5 | 7.72 |
| 44312.510416666664 | 7.72 |
| 44312.520833333336 | 7.72 |
| 44312.53125 | 7.72 |
| 44312.541666666664 | 7.71 |
| 44312.552083333336 | 7.71 |
| 44312.5625 | 7.72 |
| 44312.572916666664 | 7.72 |
| 44312.583333333336 | 7.72 |
| 44312.59375 | 7.72 |
| 44312.604166666664 | 7.72 |
| 44312.614583333336 | 7.72 |
| 44312.625 | 7.72 |
| 44312.635416666664 | 7.72 |
| 44312.645833333336 | 7.71 |
| 44312.65625 | 7.71 |
| 44312.666666666664 | 7.7 |
| 44312.677083333336 | 7.7 |
| 44312.6875 | 7.7 |
| 44312.697916666664 | 7.71 |
| 44312.708333333336 | 7.71 |
| 44312.71875 | 7.71 |
| 44312.729166666664 | 7.69 |
| 44312.739583333336 | 7.69 |
| 44312.75 | 7.69 |
| 44312.760416666664 | 7.69 |
| 44312.770833333336 | 7.69 |
| 44312.78125 | 7.69 |
| 44312.791666666664 | 7.7 |
| 44312.802083333336 | 7.69 |
| 44312.8125 | 7.68 |
| 44312.822916666664 | 7.68 |
| 44312.833333333336 | 7.68 |
| 44312.84375 | 7.7 |
| 44312.854166666664 | 7.74 |
| 44312.864583333336 | 7.75 |
| 44312.875 | 7.76 |
| 44312.885416666664 | 7.77 |
| 44312.895833333336 | 7.77 |
| 44312.90625 | 7.77 |
| 44312.916666666664 | 7.76 |
| 44312.927083333336 | 7.75 |
| 44312.9375 | 7.75 |
| 44312.947916666664 | 7.76 |
| 44312.958333333336 | 7.76 |
| 44312.96875 | 7.77 |
| 44312.979166666664 | 7.77 |
| 44312.989583333336 | 7.76 |
| 44313.0 | 7.76 |
| 44313.010416666664 | 7.76 |
| 44313.020833333336 | 7.76 |
| 44313.03125 | 7.76 |
| 44313.041666666664 | 7.76 |
| 44313.052083333336 | 7.76 |
| 44313.0625 | 7.77 |
| 44313.072916666664 | 7.76 |
| 44313.083333333336 | 7.76 |
| 44313.09375 | 7.76 |
| 44313.104166666664 | 7.75 |
| 44313.114583333336 | 7.74 |
| 44313.125 | 7.73 |
| 44313.135416666664 | 7.72 |
| 44313.145833333336 | 7.7 |
| 44313.15625 | 7.68 |
| 44313.166666666664 | 7.67 |
| 44313.177083333336 | 7.64 |
| 44313.1875 | 7.61 |
| 44313.197916666664 | 7.61 |
| 44313.208333333336 | 7.62 |
| 44313.21875 | 7.65 |
| 44313.229166666664 | 7.68 |
| 44313.239583333336 | 7.67 |
| 44313.25 | 7.67 |
| 44313.260416666664 | 7.66 |
| 44313.270833333336 | 7.64 |
| 44313.28125 | 7.62 |
| 44313.291666666664 | 7.6 |
| 44313.302083333336 | 7.58 |
| 44313.3125 | 7.58 |
| 44313.322916666664 | 7.58 |
| 44313.333333333336 | 7.58 |
| 44313.34375 | 7.58 |
| 44313.354166666664 | 7.58 |
| 44313.364583333336 | 7.59 |
| 44313.375 | 7.6 |
| 44313.385416666664 | 7.62 |
| 44313.395833333336 | 7.63 |
| 44313.40625 | 7.64 |
| 44313.416666666664 | 7.64 |
| 44313.427083333336 | 7.65 |
| 44313.4375 | 7.65 |
| 44313.447916666664 | 7.65 |
| 44313.458333333336 | 7.66 |
| 44313.46875 | 7.66 |
| 44313.479166666664 | 7.68 |
| 44313.489583333336 | 7.68 |
| 44313.5 | 7.69 |
| 44313.510416666664 | 7.7 |
| 44313.520833333336 | 7.7 |
| 44313.53125 | 7.7 |
| 44313.541666666664 | 7.7 |
| 44313.552083333336 | 7.69 |
| 44313.5625 | 7.69 |
| 44313.572916666664 | 7.69 |
| 44313.583333333336 | 7.68 |
| 44313.59375 | 7.69 |
| 44313.604166666664 | 7.69 |
| 44313.614583333336 | 7.71 |
| 44313.625 | 7.72 |
| 44313.635416666664 | 7.72 |
| 44313.645833333336 | 7.72 |
| 44313.65625 | 7.72 |
| 44313.666666666664 | 7.72 |
| 44313.677083333336 | 7.72 |
| 44313.6875 | 7.73 |
| 44313.697916666664 | 7.72 |
| 44313.708333333336 | 7.72 |
| 44313.71875 | 7.72 |
| 44313.729166666664 | 7.72 |
| 44313.739583333336 | 7.72 |
| 44313.75 | 7.71 |
| 44313.760416666664 | 7.7 |
| 44313.770833333336 | 7.69 |
| 44313.78125 | 7.69 |
| 44313.791666666664 | 7.69 |
| 44313.802083333336 | 7.69 |
| 44313.8125 | 7.69 |
| 44313.822916666664 | 7.7 |
| 44313.833333333336 | 7.69 |
| 44313.84375 | 7.68 |
| 44313.854166666664 | 7.68 |
| 44313.864583333336 | 7.67 |
| 44313.875 | 7.69 |
| 44313.885416666664 | 7.71 |
| 44313.895833333336 | 7.73 |
| 44313.90625 | 7.73 |
| 44313.916666666664 | 7.74 |
| 44313.927083333336 | 7.74 |
| 44313.9375 | 7.74 |
| 44313.947916666664 | 7.73 |
| 44313.958333333336 | 7.73 |
| 44313.96875 | 7.73 |
| 44313.979166666664 | 7.73 |
| 44313.989583333336 | 7.73 |
| 44314.0 | 7.73 |
| 44314.010416666664 | 7.74 |
| 44314.020833333336 | 7.74 |
| 44314.03125 | 7.73 |
| 44314.041666666664 | 7.73 |
| 44314.052083333336 | 7.72 |
| 44314.0625 | 7.72 |
| 44314.072916666664 | 7.72 |
| 44314.083333333336 | 7.73 |
| 44314.09375 | 7.73 |
| 44314.104166666664 | 7.73 |
| 44314.114583333336 | 7.72 |
| 44314.125 | 7.72 |
| 44314.135416666664 | 7.71 |
| 44314.145833333336 | 7.7 |
| 44314.15625 | 7.7 |
| 44314.166666666664 | 7.68 |
| 44314.177083333336 | 7.67 |
| 44314.1875 | 7.64 |
| 44314.197916666664 | 7.61 |
| 44314.208333333336 | 7.59 |
| 44314.21875 | 7.56 |
| 44314.229166666664 | 7.57 |
| 44314.239583333336 | 7.59 |
| 44314.25 | 7.6 |
| 44314.260416666664 | 7.63 |
| 44314.270833333336 | 7.63 |
| 44314.28125 | 7.61 |
| 44314.291666666664 | 7.61 |
| 44314.302083333336 | 7.59 |
| 44314.3125 | 7.58 |
| 44314.322916666664 | 7.55 |
| 44314.333333333336 | 7.53 |
| 44314.34375 | 7.52 |
| 44314.354166666664 | 7.52 |
| 44314.364583333336 | 7.52 |
| 44314.375 | 7.52 |
| 44314.385416666664 | 7.52 |
| 44314.395833333336 | 7.52 |
| 44314.40625 | 7.54 |
| 44314.416666666664 | 7.57 |
| 44314.427083333336 | 7.59 |
| 44314.4375 | 7.6 |
| 44314.447916666664 | 7.6 |
| 44314.458333333336 | 7.61 |
| 44314.46875 | 7.61 |
| 44314.479166666664 | 7.62 |
| 44314.489583333336 | 7.62 |
| 44314.5 | 7.63 |
| 44314.510416666664 | 7.64 |
| 44314.520833333336 | 7.65 |
| 44314.53125 | 7.66 |
| 44314.541666666664 | 7.66 |
| 44314.552083333336 | 7.66 |
| 44314.5625 | 7.66 |
| 44314.572916666664 | 7.65 |
| 44314.583333333336 | 7.65 |
| 44314.59375 | 7.65 |
| 44314.604166666664 | 7.65 |
| 44314.614583333336 | 7.64 |
| 44314.625 | 7.64 |
| 44314.635416666664 | 7.65 |
| 44314.645833333336 | 7.66 |
| 44314.65625 | 7.67 |
| 44314.666666666664 | 7.68 |
| 44314.677083333336 | 7.68 |
| 44314.6875 | 7.68 |
| 44314.697916666664 | 7.69 |
| 44314.708333333336 | 7.69 |
| 44314.71875 | 7.68 |
| 44314.729166666664 | 7.69 |
| 44314.739583333336 | 7.69 |
| 44314.75 | 7.69 |
| 44314.760416666664 | 7.68 |
| 44314.770833333336 | 7.68 |
| 44314.78125 | 7.67 |
| 44314.791666666664 | 7.66 |
| 44314.802083333336 | 7.65 |
| 44314.8125 | 7.65 |
| 44314.822916666664 | 7.65 |
| 44314.833333333336 | 7.66 |
| 44314.84375 | 7.66 |
| 44314.854166666664 | 7.66 |
| 44314.864583333336 | 7.65 |
| 44314.875 | 7.64 |
| 44314.885416666664 | 7.63 |
| 44314.895833333336 | 7.63 |
| 44314.90625 | 7.63 |
| 44314.916666666664 | 7.67 |
| 44314.927083333336 | 7.69 |
| 44314.9375 | 7.69 |
| 44314.947916666664 | 7.69 |
| 44314.958333333336 | 7.68 |
| 44314.96875 | 7.68 |
| 44314.979166666664 | 7.67 |
| 44314.989583333336 | 7.67 |
| 44315.0 | 7.67 |
| 44315.010416666664 | 7.67 |
| 44315.020833333336 | 7.68 |
| 44315.03125 | 7.68 |
| 44315.041666666664 | 7.69 |
| 44315.052083333336 | 7.69 |
| 44315.0625 | 7.69 |
| 44315.072916666664 | 7.68 |
| 44315.083333333336 | 7.68 |
| 44315.09375 | 7.68 |
| 44315.104166666664 | 7.68 |
| 44315.114583333336 | 7.68 |
| 44315.125 | 7.68 |
| 44315.135416666664 | 7.68 |
| 44315.145833333336 | 7.68 |
| 44315.15625 | 7.68 |
| 44315.166666666664 | 7.67 |
| 44315.177083333336 | 7.66 |
| 44315.1875 | 7.65 |
| 44315.197916666664 | 7.64 |
| 44315.208333333336 | 7.63 |
| 44315.21875 | 7.61 |
| 44315.229166666664 | 7.57 |
| 44315.239583333336 | 7.56 |
| 44315.25 | 7.53 |
| 44315.260416666664 | 7.51 |
| 44315.270833333336 | 7.5 |
| 44315.28125 | 7.51 |
| 44315.291666666664 | 7.53 |
| 44315.302083333336 | 7.57 |
| 44315.3125 | 7.56 |
| 44315.322916666664 | 7.56 |
| 44315.333333333336 | 7.55 |
| 44315.34375 | 7.53 |
| 44315.354166666664 | 7.5 |
| 44315.364583333336 | 7.47 |
| 44315.375 | 7.45 |
| 44315.385416666664 | 7.44 |
| 44315.395833333336 | 7.44 |
| 44315.40625 | 7.45 |
| 44315.416666666664 | 7.44 |
| 44315.427083333336 | 7.45 |
| 44315.4375 | 7.46 |
| 44315.447916666664 | 7.48 |
| 44315.458333333336 | 7.52 |
| 44315.46875 | 7.52 |
| 44315.479166666664 | 7.54 |
| 44315.489583333336 | 7.54 |
| 44315.5 | 7.55 |
| 44315.510416666664 | 7.55 |
| 44315.520833333336 | 7.55 |
| 44315.53125 | 7.56 |
| 44315.541666666664 | 7.57 |
| 44315.552083333336 | 7.58 |
| 44315.5625 | 7.59 |
| 44315.572916666664 | 7.6 |
| 44315.583333333336 | 7.61 |
| 44315.59375 | 7.62 |
| 44315.604166666664 | 7.62 |
| 44315.614583333336 | 7.62 |
| 44315.625 | 7.62 |
| 44315.635416666664 | 7.62 |
| 44315.645833333336 | 7.61 |
| 44315.65625 | 7.6 |
| 44315.666666666664 | 7.61 |
| 44315.677083333336 | 7.62 |
| 44315.6875 | 7.63 |
| 44315.697916666664 | 7.66 |
| 44315.708333333336 | 7.66 |
| 44315.71875 | 7.66 |
| 44315.729166666664 | 7.67 |
| 44315.739583333336 | 7.68 |
| 44315.75 | 7.68 |
| 44315.760416666664 | 7.68 |
| 44315.770833333336 | 7.66 |
| 44315.78125 | 7.66 |
| 44315.791666666664 | 7.66 |
| 44315.802083333336 | 7.66 |
| 44315.8125 | 7.65 |
| 44315.822916666664 | 7.65 |
| 44315.833333333336 | 7.64 |
| 44315.84375 | 7.64 |
| 44315.854166666664 | 7.63 |
| 44315.864583333336 | 7.62 |
| 44315.875 | 7.63 |
| 44315.885416666664 | 7.62 |
| 44315.895833333336 | 7.62 |
| 44315.90625 | 7.61 |
| 44315.916666666664 | 7.6 |
| 44315.927083333336 | 7.59 |
| 44315.9375 | 7.6 |
| 44315.947916666664 | 7.62 |
| 44315.958333333336 | 7.63 |
| 44315.96875 | 7.64 |
| 44315.979166666664 | 7.64 |
| 44315.989583333336 | 7.65 |
| 44316.0 | 7.64 |
| 44316.010416666664 | 7.64 |
| 44316.020833333336 | 7.64 |
| 44316.03125 | 7.64 |
| 44316.041666666664 | 7.64 |
| 44316.052083333336 | 7.64 |
| 44316.0625 | 7.64 |
| 44316.072916666664 | 7.65 |
| 44316.083333333336 | 7.65 |
| 44316.09375 | 7.65 |
| 44316.104166666664 | 7.65 |
| 44316.114583333336 | 7.65 |
| 44316.125 | 7.65 |
| 44316.135416666664 | 7.65 |
| 44316.145833333336 | 7.66 |
| 44316.15625 | 7.66 |
| 44316.166666666664 | 7.66 |
| 44316.177083333336 | 7.65 |
| 44316.1875 | 7.65 |
| 44316.197916666664 | 7.65 |
| 44316.208333333336 | 7.65 |
| 44316.21875 | 7.65 |
| 44316.229166666664 | 7.63 |
| 44316.239583333336 | 7.61 |
| 44316.25 | 7.6 |
| 44316.260416666664 | 7.58 |
| 44316.270833333336 | 7.55 |
| 44316.28125 | 7.54 |
| 44316.291666666664 | 7.51 |
| 44316.302083333336 | 7.48 |
| 44316.3125 | 7.45 |
| 44316.322916666664 | 7.46 |
| 44316.333333333336 | 7.5 |
| 44316.34375 | 7.52 |
| 44316.354166666664 | 7.52 |
| 44316.364583333336 | 7.51 |
| 44316.375 | 7.5 |
| 44316.385416666664 | 7.47 |
| 44316.395833333336 | 7.46 |
| 44316.40625 | 7.43 |
| 44316.416666666664 | 7.42 |
| 44316.427083333336 | 7.41 |
| 44316.4375 | 7.4 |
| 44316.447916666664 | 7.4 |
| 44316.458333333336 | 7.41 |
| 44316.46875 | 7.4 |
| 44316.479166666664 | 7.41 |
| 44316.489583333336 | 7.43 |
| 44316.5 | 7.46 |
| 44316.510416666664 | 7.48 |
| 44316.520833333336 | 7.5 |
| 44316.53125 | 7.5 |
| 44316.541666666664 | 7.5 |
| 44316.552083333336 | 7.51 |
| 44316.5625 | 7.52 |
| 44316.572916666664 | 7.53 |
| 44316.583333333336 | 7.55 |
| 44316.59375 | 7.56 |
| 44316.604166666664 | 7.58 |
| 44316.614583333336 | 7.59 |
| 44316.625 | 7.61 |
| 44316.635416666664 | 7.62 |
| 44316.645833333336 | 7.63 |
| 44316.65625 | 7.64 |
| 44316.666666666664 | 7.64 |
| 44316.677083333336 | 7.65 |
| 44316.6875 | 7.65 |
| 44316.697916666664 | 7.66 |
| 44316.708333333336 | 7.65 |
| 44316.71875 | 7.66 |
| 44316.729166666664 | 7.67 |
| 44316.739583333336 | 7.69 |
| 44316.75 | 7.68 |
| 44316.760416666664 | 7.68 |
| 44316.770833333336 | 7.69 |
| 44316.78125 | 7.68 |
| 44316.791666666664 | 7.68 |
| 44316.802083333336 | 7.68 |
| 44316.8125 | 7.68 |
| 44316.822916666664 | 7.67 |
| 44316.833333333336 | 7.66 |
| 44316.84375 | 7.66 |
| 44316.854166666664 | 7.67 |
| 44316.864583333336 | 7.66 |
| 44316.875 | 7.66 |
| 44316.885416666664 | 7.66 |
| 44316.895833333336 | 7.66 |
| 44316.90625 | 7.66 |
| 44316.916666666664 | 7.66 |
| 44316.927083333336 | 7.65 |
| 44316.9375 | 7.65 |
| 44316.947916666664 | 7.64 |
| 44316.958333333336 | 7.64 |
| 44316.96875 | 7.62 |
| 44316.979166666664 | 7.63 |
| 44316.989583333336 | 7.67 |
| 44317.0 | 7.67 |
| 44317.010416666664 | 7.69 |
| 44317.020833333336 | 7.7 |
| 44317.03125 | 7.7 |
| 44317.041666666664 | 7.7 |
| 44317.052083333336 | 7.7 |
| 44317.0625 | 7.7 |
| 44317.072916666664 | 7.7 |
| 44317.083333333336 | 7.7 |
| 44317.09375 | 7.7 |
| 44317.104166666664 | 7.7 |
| 44317.114583333336 | 7.7 |
| 44317.125 | 7.71 |
| 44317.135416666664 | 7.71 |
| 44317.145833333336 | 7.71 |
| 44317.15625 | 7.71 |